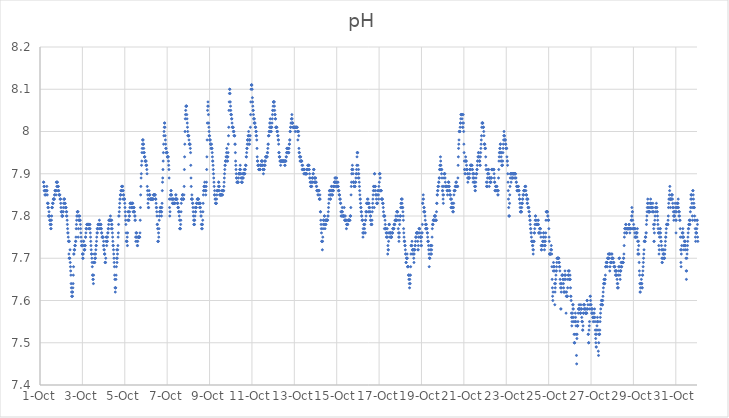
| Category | pH |
|---|---|
| 44835.166666666664 | 7.88 |
| 44835.177083333336 | 7.88 |
| 44835.1875 | 7.87 |
| 44835.197916666664 | 7.86 |
| 44835.208333333336 | 7.87 |
| 44835.21875 | 7.86 |
| 44835.229166666664 | 7.85 |
| 44835.239583333336 | 7.86 |
| 44835.25 | 7.86 |
| 44835.260416666664 | 7.86 |
| 44835.270833333336 | 7.85 |
| 44835.28125 | 7.85 |
| 44835.291666666664 | 7.86 |
| 44835.302083333336 | 7.86 |
| 44835.3125 | 7.86 |
| 44835.322916666664 | 7.87 |
| 44835.333333333336 | 7.86 |
| 44835.34375 | 7.85 |
| 44835.354166666664 | 7.83 |
| 44835.364583333336 | 7.83 |
| 44835.375 | 7.82 |
| 44835.385416666664 | 7.83 |
| 44835.395833333336 | 7.82 |
| 44835.40625 | 7.8 |
| 44835.416666666664 | 7.8 |
| 44835.427083333336 | 7.81 |
| 44835.4375 | 7.8 |
| 44835.447916666664 | 7.8 |
| 44835.458333333336 | 7.79 |
| 44835.46875 | 7.79 |
| 44835.479166666664 | 7.78 |
| 44835.489583333336 | 7.79 |
| 44835.5 | 7.78 |
| 44835.510416666664 | 7.77 |
| 44835.520833333336 | 7.77 |
| 44835.53125 | 7.78 |
| 44835.541666666664 | 7.79 |
| 44835.552083333336 | 7.8 |
| 44835.5625 | 7.82 |
| 44835.572916666664 | 7.82 |
| 44835.583333333336 | 7.82 |
| 44835.59375 | 7.83 |
| 44835.604166666664 | 7.83 |
| 44835.614583333336 | 7.83 |
| 44835.625 | 7.84 |
| 44835.635416666664 | 7.84 |
| 44835.645833333336 | 7.84 |
| 44835.65625 | 7.84 |
| 44835.666666666664 | 7.84 |
| 44835.677083333336 | 7.84 |
| 44835.6875 | 7.85 |
| 44835.697916666664 | 7.85 |
| 44835.708333333336 | 7.86 |
| 44835.71875 | 7.86 |
| 44835.729166666664 | 7.86 |
| 44835.739583333336 | 7.86 |
| 44835.75 | 7.86 |
| 44835.760416666664 | 7.85 |
| 44835.770833333336 | 7.88 |
| 44835.78125 | 7.88 |
| 44835.791666666664 | 7.87 |
| 44835.802083333336 | 7.86 |
| 44835.8125 | 7.88 |
| 44835.822916666664 | 7.88 |
| 44835.833333333336 | 7.87 |
| 44835.84375 | 7.87 |
| 44835.854166666664 | 7.87 |
| 44835.864583333336 | 7.87 |
| 44835.875 | 7.86 |
| 44835.885416666664 | 7.86 |
| 44835.895833333336 | 7.85 |
| 44835.90625 | 7.85 |
| 44835.916666666664 | 7.85 |
| 44835.927083333336 | 7.85 |
| 44835.9375 | 7.85 |
| 44835.947916666664 | 7.84 |
| 44835.958333333336 | 7.84 |
| 44835.96875 | 7.84 |
| 44835.979166666664 | 7.83 |
| 44835.989583333336 | 7.82 |
| 44836.0 | 7.81 |
| 44836.010416666664 | 7.81 |
| 44836.020833333336 | 7.81 |
| 44836.03125 | 7.8 |
| 44836.041666666664 | 7.8 |
| 44836.052083333336 | 7.8 |
| 44836.0625 | 7.8 |
| 44836.072916666664 | 7.8 |
| 44836.083333333336 | 7.81 |
| 44836.09375 | 7.81 |
| 44836.104166666664 | 7.82 |
| 44836.114583333336 | 7.83 |
| 44836.125 | 7.84 |
| 44836.135416666664 | 7.84 |
| 44836.145833333336 | 7.84 |
| 44836.15625 | 7.84 |
| 44836.166666666664 | 7.83 |
| 44836.177083333336 | 7.83 |
| 44836.1875 | 7.83 |
| 44836.197916666664 | 7.82 |
| 44836.208333333336 | 7.82 |
| 44836.21875 | 7.82 |
| 44836.229166666664 | 7.82 |
| 44836.239583333336 | 7.81 |
| 44836.25 | 7.8 |
| 44836.260416666664 | 7.81 |
| 44836.270833333336 | 7.8 |
| 44836.28125 | 7.79 |
| 44836.291666666664 | 7.78 |
| 44836.302083333336 | 7.77 |
| 44836.3125 | 7.76 |
| 44836.322916666664 | 7.76 |
| 44836.333333333336 | 7.75 |
| 44836.34375 | 7.74 |
| 44836.354166666664 | 7.74 |
| 44836.364583333336 | 7.71 |
| 44836.375 | 7.7 |
| 44836.385416666664 | 7.74 |
| 44836.395833333336 | 7.7 |
| 44836.40625 | 7.7 |
| 44836.416666666664 | 7.72 |
| 44836.427083333336 | 7.69 |
| 44836.4375 | 7.68 |
| 44836.447916666664 | 7.67 |
| 44836.458333333336 | 7.66 |
| 44836.46875 | 7.64 |
| 44836.479166666664 | 7.63 |
| 44836.489583333336 | 7.62 |
| 44836.5 | 7.61 |
| 44836.510416666664 | 7.61 |
| 44836.520833333336 | 7.62 |
| 44836.53125 | 7.61 |
| 44836.541666666664 | 7.62 |
| 44836.552083333336 | 7.63 |
| 44836.5625 | 7.64 |
| 44836.572916666664 | 7.66 |
| 44836.583333333336 | 7.68 |
| 44836.59375 | 7.71 |
| 44836.604166666664 | 7.71 |
| 44836.614583333336 | 7.72 |
| 44836.625 | 7.72 |
| 44836.635416666664 | 7.72 |
| 44836.645833333336 | 7.73 |
| 44836.65625 | 7.73 |
| 44836.666666666664 | 7.73 |
| 44836.677083333336 | 7.74 |
| 44836.6875 | 7.74 |
| 44836.697916666664 | 7.75 |
| 44836.708333333336 | 7.77 |
| 44836.71875 | 7.78 |
| 44836.729166666664 | 7.79 |
| 44836.739583333336 | 7.8 |
| 44836.75 | 7.8 |
| 44836.760416666664 | 7.81 |
| 44836.770833333336 | 7.81 |
| 44836.78125 | 7.81 |
| 44836.791666666664 | 7.81 |
| 44836.802083333336 | 7.75 |
| 44836.8125 | 7.77 |
| 44836.822916666664 | 7.79 |
| 44836.833333333336 | 7.8 |
| 44836.84375 | 7.8 |
| 44836.854166666664 | 7.79 |
| 44836.864583333336 | 7.79 |
| 44836.875 | 7.8 |
| 44836.885416666664 | 7.79 |
| 44836.895833333336 | 7.79 |
| 44836.90625 | 7.78 |
| 44836.916666666664 | 7.77 |
| 44836.927083333336 | 7.76 |
| 44836.9375 | 7.75 |
| 44836.947916666664 | 7.74 |
| 44836.958333333336 | 7.73 |
| 44836.96875 | 7.73 |
| 44836.979166666664 | 7.73 |
| 44836.989583333336 | 7.73 |
| 44837.0 | 7.71 |
| 44837.010416666664 | 7.71 |
| 44837.020833333336 | 7.7 |
| 44837.03125 | 7.7 |
| 44837.041666666664 | 7.71 |
| 44837.052083333336 | 7.74 |
| 44837.0625 | 7.74 |
| 44837.072916666664 | 7.73 |
| 44837.083333333336 | 7.72 |
| 44837.09375 | 7.72 |
| 44837.104166666664 | 7.72 |
| 44837.114583333336 | 7.72 |
| 44837.125 | 7.73 |
| 44837.135416666664 | 7.73 |
| 44837.145833333336 | 7.75 |
| 44837.15625 | 7.75 |
| 44837.166666666664 | 7.76 |
| 44837.177083333336 | 7.77 |
| 44837.1875 | 7.77 |
| 44837.197916666664 | 7.77 |
| 44837.208333333336 | 7.78 |
| 44837.21875 | 7.78 |
| 44837.229166666664 | 7.78 |
| 44837.239583333336 | 7.78 |
| 44837.25 | 7.78 |
| 44837.260416666664 | 7.78 |
| 44837.270833333336 | 7.78 |
| 44837.28125 | 7.78 |
| 44837.291666666664 | 7.78 |
| 44837.302083333336 | 7.78 |
| 44837.3125 | 7.77 |
| 44837.322916666664 | 7.77 |
| 44837.333333333336 | 7.77 |
| 44837.34375 | 7.78 |
| 44837.354166666664 | 7.78 |
| 44837.364583333336 | 7.77 |
| 44837.375 | 7.76 |
| 44837.385416666664 | 7.75 |
| 44837.395833333336 | 7.74 |
| 44837.40625 | 7.73 |
| 44837.416666666664 | 7.72 |
| 44837.427083333336 | 7.71 |
| 44837.4375 | 7.71 |
| 44837.447916666664 | 7.7 |
| 44837.458333333336 | 7.69 |
| 44837.46875 | 7.68 |
| 44837.479166666664 | 7.66 |
| 44837.489583333336 | 7.66 |
| 44837.5 | 7.65 |
| 44837.510416666664 | 7.65 |
| 44837.520833333336 | 7.64 |
| 44837.53125 | 7.66 |
| 44837.541666666664 | 7.69 |
| 44837.552083333336 | 7.69 |
| 44837.5625 | 7.71 |
| 44837.572916666664 | 7.69 |
| 44837.583333333336 | 7.69 |
| 44837.59375 | 7.7 |
| 44837.604166666664 | 7.7 |
| 44837.614583333336 | 7.7 |
| 44837.625 | 7.71 |
| 44837.635416666664 | 7.72 |
| 44837.645833333336 | 7.73 |
| 44837.65625 | 7.73 |
| 44837.666666666664 | 7.74 |
| 44837.677083333336 | 7.75 |
| 44837.6875 | 7.76 |
| 44837.697916666664 | 7.77 |
| 44837.708333333336 | 7.76 |
| 44837.71875 | 7.77 |
| 44837.729166666664 | 7.77 |
| 44837.739583333336 | 7.78 |
| 44837.75 | 7.78 |
| 44837.760416666664 | 7.78 |
| 44837.770833333336 | 7.78 |
| 44837.78125 | 7.78 |
| 44837.791666666664 | 7.78 |
| 44837.802083333336 | 7.79 |
| 44837.8125 | 7.78 |
| 44837.822916666664 | 7.77 |
| 44837.833333333336 | 7.77 |
| 44837.84375 | 7.78 |
| 44837.854166666664 | 7.78 |
| 44837.864583333336 | 7.78 |
| 44837.875 | 7.78 |
| 44837.885416666664 | 7.77 |
| 44837.895833333336 | 7.77 |
| 44837.90625 | 7.76 |
| 44837.916666666664 | 7.76 |
| 44837.927083333336 | 7.75 |
| 44837.9375 | 7.75 |
| 44837.947916666664 | 7.75 |
| 44837.958333333336 | 7.75 |
| 44837.96875 | 7.75 |
| 44837.979166666664 | 7.75 |
| 44837.989583333336 | 7.73 |
| 44838.0 | 7.74 |
| 44838.010416666664 | 7.73 |
| 44838.020833333336 | 7.72 |
| 44838.03125 | 7.72 |
| 44838.041666666664 | 7.71 |
| 44838.052083333336 | 7.71 |
| 44838.0625 | 7.71 |
| 44838.072916666664 | 7.69 |
| 44838.083333333336 | 7.69 |
| 44838.09375 | 7.69 |
| 44838.104166666664 | 7.7 |
| 44838.114583333336 | 7.74 |
| 44838.125 | 7.75 |
| 44838.135416666664 | 7.75 |
| 44838.145833333336 | 7.73 |
| 44838.15625 | 7.74 |
| 44838.166666666664 | 7.74 |
| 44838.177083333336 | 7.74 |
| 44838.1875 | 7.75 |
| 44838.197916666664 | 7.76 |
| 44838.208333333336 | 7.76 |
| 44838.21875 | 7.77 |
| 44838.229166666664 | 7.77 |
| 44838.239583333336 | 7.78 |
| 44838.25 | 7.79 |
| 44838.260416666664 | 7.79 |
| 44838.270833333336 | 7.79 |
| 44838.28125 | 7.79 |
| 44838.291666666664 | 7.79 |
| 44838.302083333336 | 7.79 |
| 44838.3125 | 7.79 |
| 44838.322916666664 | 7.8 |
| 44838.333333333336 | 7.79 |
| 44838.34375 | 7.79 |
| 44838.354166666664 | 7.79 |
| 44838.364583333336 | 7.77 |
| 44838.375 | 7.78 |
| 44838.385416666664 | 7.79 |
| 44838.395833333336 | 7.78 |
| 44838.40625 | 7.77 |
| 44838.416666666664 | 7.76 |
| 44838.427083333336 | 7.75 |
| 44838.4375 | 7.74 |
| 44838.447916666664 | 7.73 |
| 44838.458333333336 | 7.73 |
| 44838.46875 | 7.72 |
| 44838.479166666664 | 7.71 |
| 44838.489583333336 | 7.7 |
| 44838.5 | 7.69 |
| 44838.510416666664 | 7.68 |
| 44838.520833333336 | 7.66 |
| 44838.53125 | 7.65 |
| 44838.541666666664 | 7.63 |
| 44838.552083333336 | 7.62 |
| 44838.5625 | 7.63 |
| 44838.572916666664 | 7.63 |
| 44838.583333333336 | 7.65 |
| 44838.59375 | 7.66 |
| 44838.604166666664 | 7.68 |
| 44838.614583333336 | 7.7 |
| 44838.625 | 7.72 |
| 44838.635416666664 | 7.69 |
| 44838.645833333336 | 7.7 |
| 44838.65625 | 7.71 |
| 44838.666666666664 | 7.72 |
| 44838.677083333336 | 7.73 |
| 44838.6875 | 7.75 |
| 44838.697916666664 | 7.76 |
| 44838.708333333336 | 7.78 |
| 44838.71875 | 7.8 |
| 44838.729166666664 | 7.8 |
| 44838.739583333336 | 7.81 |
| 44838.75 | 7.82 |
| 44838.760416666664 | 7.83 |
| 44838.770833333336 | 7.84 |
| 44838.78125 | 7.84 |
| 44838.791666666664 | 7.85 |
| 44838.802083333336 | 7.85 |
| 44838.8125 | 7.85 |
| 44838.822916666664 | 7.86 |
| 44838.833333333336 | 7.86 |
| 44838.84375 | 7.86 |
| 44838.854166666664 | 7.87 |
| 44838.864583333336 | 7.87 |
| 44838.875 | 7.87 |
| 44838.885416666664 | 7.87 |
| 44838.895833333336 | 7.87 |
| 44838.90625 | 7.86 |
| 44838.916666666664 | 7.84 |
| 44838.927083333336 | 7.86 |
| 44838.9375 | 7.85 |
| 44838.947916666664 | 7.85 |
| 44838.958333333336 | 7.84 |
| 44838.96875 | 7.84 |
| 44838.979166666664 | 7.84 |
| 44838.989583333336 | 7.84 |
| 44839.0 | 7.83 |
| 44839.010416666664 | 7.82 |
| 44839.020833333336 | 7.81 |
| 44839.03125 | 7.8 |
| 44839.041666666664 | 7.79 |
| 44839.052083333336 | 7.78 |
| 44839.0625 | 7.76 |
| 44839.072916666664 | 7.74 |
| 44839.083333333336 | 7.74 |
| 44839.09375 | 7.74 |
| 44839.104166666664 | 7.74 |
| 44839.114583333336 | 7.75 |
| 44839.125 | 7.73 |
| 44839.135416666664 | 7.76 |
| 44839.145833333336 | 7.79 |
| 44839.15625 | 7.81 |
| 44839.166666666664 | 7.81 |
| 44839.177083333336 | 7.79 |
| 44839.1875 | 7.79 |
| 44839.197916666664 | 7.79 |
| 44839.208333333336 | 7.8 |
| 44839.21875 | 7.8 |
| 44839.229166666664 | 7.81 |
| 44839.239583333336 | 7.82 |
| 44839.25 | 7.83 |
| 44839.260416666664 | 7.83 |
| 44839.270833333336 | 7.83 |
| 44839.28125 | 7.83 |
| 44839.291666666664 | 7.83 |
| 44839.302083333336 | 7.83 |
| 44839.3125 | 7.83 |
| 44839.322916666664 | 7.82 |
| 44839.333333333336 | 7.82 |
| 44839.34375 | 7.83 |
| 44839.354166666664 | 7.83 |
| 44839.364583333336 | 7.83 |
| 44839.375 | 7.83 |
| 44839.385416666664 | 7.82 |
| 44839.395833333336 | 7.81 |
| 44839.40625 | 7.81 |
| 44839.416666666664 | 7.82 |
| 44839.427083333336 | 7.82 |
| 44839.4375 | 7.82 |
| 44839.447916666664 | 7.81 |
| 44839.458333333336 | 7.81 |
| 44839.46875 | 7.8 |
| 44839.479166666664 | 7.79 |
| 44839.489583333336 | 7.8 |
| 44839.5 | 7.79 |
| 44839.510416666664 | 7.75 |
| 44839.520833333336 | 7.74 |
| 44839.53125 | 7.76 |
| 44839.541666666664 | 7.76 |
| 44839.552083333336 | 7.75 |
| 44839.5625 | 7.76 |
| 44839.572916666664 | 7.75 |
| 44839.583333333336 | 7.74 |
| 44839.59375 | 7.73 |
| 44839.604166666664 | 7.73 |
| 44839.614583333336 | 7.74 |
| 44839.625 | 7.75 |
| 44839.635416666664 | 7.75 |
| 44839.645833333336 | 7.75 |
| 44839.65625 | 7.75 |
| 44839.666666666664 | 7.75 |
| 44839.677083333336 | 7.75 |
| 44839.6875 | 7.75 |
| 44839.697916666664 | 7.75 |
| 44839.708333333336 | 7.75 |
| 44839.71875 | 7.76 |
| 44839.729166666664 | 7.79 |
| 44839.739583333336 | 7.82 |
| 44839.75 | 7.85 |
| 44839.760416666664 | 7.87 |
| 44839.770833333336 | 7.89 |
| 44839.78125 | 7.9 |
| 44839.791666666664 | 7.92 |
| 44839.802083333336 | 7.93 |
| 44839.8125 | 7.95 |
| 44839.822916666664 | 7.96 |
| 44839.833333333336 | 7.97 |
| 44839.84375 | 7.98 |
| 44839.854166666664 | 7.98 |
| 44839.864583333336 | 7.98 |
| 44839.875 | 7.97 |
| 44839.885416666664 | 7.97 |
| 44839.895833333336 | 7.96 |
| 44839.90625 | 7.95 |
| 44839.916666666664 | 7.95 |
| 44839.927083333336 | 7.94 |
| 44839.9375 | 7.94 |
| 44839.947916666664 | 7.94 |
| 44839.958333333336 | 7.93 |
| 44839.96875 | 7.93 |
| 44839.979166666664 | 7.93 |
| 44839.989583333336 | 7.93 |
| 44840.0 | 7.92 |
| 44840.010416666664 | 7.93 |
| 44840.020833333336 | 7.92 |
| 44840.03125 | 7.92 |
| 44840.041666666664 | 7.91 |
| 44840.052083333336 | 7.9 |
| 44840.0625 | 7.87 |
| 44840.072916666664 | 7.86 |
| 44840.083333333336 | 7.85 |
| 44840.09375 | 7.83 |
| 44840.104166666664 | 7.84 |
| 44840.114583333336 | 7.82 |
| 44840.125 | 7.82 |
| 44840.135416666664 | 7.84 |
| 44840.145833333336 | 7.86 |
| 44840.15625 | 7.85 |
| 44840.166666666664 | 7.85 |
| 44840.177083333336 | 7.85 |
| 44840.1875 | 7.85 |
| 44840.197916666664 | 7.84 |
| 44840.208333333336 | 7.84 |
| 44840.21875 | 7.84 |
| 44840.229166666664 | 7.84 |
| 44840.239583333336 | 7.84 |
| 44840.25 | 7.84 |
| 44840.260416666664 | 7.84 |
| 44840.270833333336 | 7.84 |
| 44840.28125 | 7.84 |
| 44840.291666666664 | 7.84 |
| 44840.302083333336 | 7.84 |
| 44840.3125 | 7.84 |
| 44840.322916666664 | 7.84 |
| 44840.333333333336 | 7.84 |
| 44840.34375 | 7.84 |
| 44840.354166666664 | 7.85 |
| 44840.364583333336 | 7.85 |
| 44840.375 | 7.85 |
| 44840.385416666664 | 7.85 |
| 44840.395833333336 | 7.85 |
| 44840.40625 | 7.85 |
| 44840.416666666664 | 7.85 |
| 44840.427083333336 | 7.85 |
| 44840.4375 | 7.85 |
| 44840.447916666664 | 7.84 |
| 44840.458333333336 | 7.84 |
| 44840.46875 | 7.84 |
| 44840.479166666664 | 7.83 |
| 44840.489583333336 | 7.82 |
| 44840.5 | 7.82 |
| 44840.510416666664 | 7.81 |
| 44840.520833333336 | 7.8 |
| 44840.53125 | 7.78 |
| 44840.541666666664 | 7.78 |
| 44840.552083333336 | 7.77 |
| 44840.5625 | 7.74 |
| 44840.572916666664 | 7.74 |
| 44840.583333333336 | 7.74 |
| 44840.59375 | 7.76 |
| 44840.604166666664 | 7.75 |
| 44840.614583333336 | 7.77 |
| 44840.625 | 7.79 |
| 44840.635416666664 | 7.8 |
| 44840.645833333336 | 7.81 |
| 44840.65625 | 7.81 |
| 44840.666666666664 | 7.81 |
| 44840.677083333336 | 7.82 |
| 44840.6875 | 7.82 |
| 44840.697916666664 | 7.82 |
| 44840.708333333336 | 7.81 |
| 44840.71875 | 7.81 |
| 44840.729166666664 | 7.8 |
| 44840.739583333336 | 7.81 |
| 44840.75 | 7.82 |
| 44840.760416666664 | 7.83 |
| 44840.770833333336 | 7.86 |
| 44840.78125 | 7.88 |
| 44840.791666666664 | 7.89 |
| 44840.802083333336 | 7.91 |
| 44840.8125 | 7.93 |
| 44840.822916666664 | 7.95 |
| 44840.833333333336 | 7.97 |
| 44840.84375 | 7.99 |
| 44840.854166666664 | 8 |
| 44840.864583333336 | 8.01 |
| 44840.875 | 8.02 |
| 44840.885416666664 | 8.02 |
| 44840.895833333336 | 8.01 |
| 44840.90625 | 7.99 |
| 44840.916666666664 | 7.98 |
| 44840.927083333336 | 7.97 |
| 44840.9375 | 7.96 |
| 44840.947916666664 | 7.96 |
| 44840.958333333336 | 7.95 |
| 44840.96875 | 7.95 |
| 44840.979166666664 | 7.95 |
| 44840.989583333336 | 7.95 |
| 44841.0 | 7.95 |
| 44841.010416666664 | 7.94 |
| 44841.020833333336 | 7.94 |
| 44841.03125 | 7.94 |
| 44841.041666666664 | 7.94 |
| 44841.052083333336 | 7.94 |
| 44841.0625 | 7.93 |
| 44841.072916666664 | 7.92 |
| 44841.083333333336 | 7.91 |
| 44841.09375 | 7.89 |
| 44841.104166666664 | 7.84 |
| 44841.114583333336 | 7.82 |
| 44841.125 | 7.8 |
| 44841.135416666664 | 7.81 |
| 44841.145833333336 | 7.84 |
| 44841.15625 | 7.85 |
| 44841.166666666664 | 7.85 |
| 44841.177083333336 | 7.86 |
| 44841.1875 | 7.86 |
| 44841.197916666664 | 7.85 |
| 44841.208333333336 | 7.85 |
| 44841.21875 | 7.84 |
| 44841.229166666664 | 7.84 |
| 44841.239583333336 | 7.84 |
| 44841.25 | 7.83 |
| 44841.260416666664 | 7.83 |
| 44841.270833333336 | 7.84 |
| 44841.28125 | 7.84 |
| 44841.291666666664 | 7.84 |
| 44841.302083333336 | 7.83 |
| 44841.3125 | 7.83 |
| 44841.322916666664 | 7.83 |
| 44841.333333333336 | 7.83 |
| 44841.34375 | 7.83 |
| 44841.354166666664 | 7.83 |
| 44841.364583333336 | 7.83 |
| 44841.375 | 7.84 |
| 44841.385416666664 | 7.84 |
| 44841.395833333336 | 7.84 |
| 44841.40625 | 7.85 |
| 44841.416666666664 | 7.85 |
| 44841.427083333336 | 7.84 |
| 44841.4375 | 7.84 |
| 44841.447916666664 | 7.84 |
| 44841.458333333336 | 7.84 |
| 44841.46875 | 7.84 |
| 44841.479166666664 | 7.83 |
| 44841.489583333336 | 7.83 |
| 44841.5 | 7.83 |
| 44841.510416666664 | 7.82 |
| 44841.520833333336 | 7.82 |
| 44841.53125 | 7.82 |
| 44841.541666666664 | 7.81 |
| 44841.552083333336 | 7.81 |
| 44841.5625 | 7.81 |
| 44841.572916666664 | 7.8 |
| 44841.583333333336 | 7.79 |
| 44841.59375 | 7.77 |
| 44841.604166666664 | 7.77 |
| 44841.614583333336 | 7.77 |
| 44841.625 | 7.77 |
| 44841.635416666664 | 7.78 |
| 44841.645833333336 | 7.79 |
| 44841.65625 | 7.81 |
| 44841.666666666664 | 7.83 |
| 44841.677083333336 | 7.84 |
| 44841.6875 | 7.84 |
| 44841.697916666664 | 7.84 |
| 44841.708333333336 | 7.84 |
| 44841.71875 | 7.85 |
| 44841.729166666664 | 7.85 |
| 44841.739583333336 | 7.85 |
| 44841.75 | 7.84 |
| 44841.760416666664 | 7.84 |
| 44841.770833333336 | 7.84 |
| 44841.78125 | 7.84 |
| 44841.791666666664 | 7.85 |
| 44841.802083333336 | 7.87 |
| 44841.8125 | 7.91 |
| 44841.822916666664 | 7.94 |
| 44841.833333333336 | 7.97 |
| 44841.84375 | 8 |
| 44841.854166666664 | 8.03 |
| 44841.864583333336 | 8.04 |
| 44841.875 | 8.05 |
| 44841.885416666664 | 8.06 |
| 44841.895833333336 | 8.06 |
| 44841.90625 | 8.06 |
| 44841.916666666664 | 8.06 |
| 44841.927083333336 | 8.04 |
| 44841.9375 | 8.03 |
| 44841.947916666664 | 8.02 |
| 44841.958333333336 | 8.01 |
| 44841.96875 | 8 |
| 44841.979166666664 | 7.99 |
| 44841.989583333336 | 7.99 |
| 44842.0 | 7.99 |
| 44842.010416666664 | 7.99 |
| 44842.020833333336 | 7.99 |
| 44842.03125 | 7.98 |
| 44842.041666666664 | 7.97 |
| 44842.052083333336 | 7.97 |
| 44842.0625 | 7.97 |
| 44842.072916666664 | 7.97 |
| 44842.083333333336 | 7.97 |
| 44842.09375 | 7.96 |
| 44842.104166666664 | 7.95 |
| 44842.114583333336 | 7.92 |
| 44842.125 | 7.89 |
| 44842.135416666664 | 7.87 |
| 44842.145833333336 | 7.84 |
| 44842.15625 | 7.84 |
| 44842.166666666664 | 7.85 |
| 44842.177083333336 | 7.84 |
| 44842.1875 | 7.84 |
| 44842.197916666664 | 7.83 |
| 44842.208333333336 | 7.83 |
| 44842.21875 | 7.82 |
| 44842.229166666664 | 7.81 |
| 44842.239583333336 | 7.8 |
| 44842.25 | 7.79 |
| 44842.260416666664 | 7.78 |
| 44842.270833333336 | 7.78 |
| 44842.28125 | 7.79 |
| 44842.291666666664 | 7.78 |
| 44842.302083333336 | 7.79 |
| 44842.3125 | 7.8 |
| 44842.322916666664 | 7.82 |
| 44842.333333333336 | 7.81 |
| 44842.34375 | 7.81 |
| 44842.354166666664 | 7.82 |
| 44842.364583333336 | 7.82 |
| 44842.375 | 7.82 |
| 44842.385416666664 | 7.83 |
| 44842.395833333336 | 7.83 |
| 44842.40625 | 7.83 |
| 44842.416666666664 | 7.84 |
| 44842.427083333336 | 7.84 |
| 44842.4375 | 7.84 |
| 44842.447916666664 | 7.84 |
| 44842.458333333336 | 7.84 |
| 44842.46875 | 7.84 |
| 44842.479166666664 | 7.84 |
| 44842.489583333336 | 7.83 |
| 44842.5 | 7.83 |
| 44842.510416666664 | 7.83 |
| 44842.520833333336 | 7.83 |
| 44842.53125 | 7.82 |
| 44842.541666666664 | 7.83 |
| 44842.552083333336 | 7.83 |
| 44842.5625 | 7.83 |
| 44842.572916666664 | 7.82 |
| 44842.583333333336 | 7.81 |
| 44842.59375 | 7.8 |
| 44842.604166666664 | 7.8 |
| 44842.614583333336 | 7.78 |
| 44842.625 | 7.77 |
| 44842.635416666664 | 7.78 |
| 44842.645833333336 | 7.78 |
| 44842.65625 | 7.77 |
| 44842.666666666664 | 7.78 |
| 44842.677083333336 | 7.79 |
| 44842.6875 | 7.81 |
| 44842.697916666664 | 7.83 |
| 44842.708333333336 | 7.85 |
| 44842.71875 | 7.86 |
| 44842.729166666664 | 7.86 |
| 44842.739583333336 | 7.87 |
| 44842.75 | 7.87 |
| 44842.760416666664 | 7.87 |
| 44842.770833333336 | 7.88 |
| 44842.78125 | 7.87 |
| 44842.791666666664 | 7.86 |
| 44842.802083333336 | 7.86 |
| 44842.8125 | 7.86 |
| 44842.822916666664 | 7.85 |
| 44842.833333333336 | 7.86 |
| 44842.84375 | 7.87 |
| 44842.854166666664 | 7.88 |
| 44842.864583333336 | 7.91 |
| 44842.875 | 7.94 |
| 44842.885416666664 | 7.98 |
| 44842.895833333336 | 8.02 |
| 44842.90625 | 8.05 |
| 44842.916666666664 | 8.06 |
| 44842.927083333336 | 8.07 |
| 44842.9375 | 8.06 |
| 44842.947916666664 | 8.04 |
| 44842.958333333336 | 8.02 |
| 44842.96875 | 8.01 |
| 44842.979166666664 | 8 |
| 44842.989583333336 | 7.99 |
| 44843.0 | 7.99 |
| 44843.010416666664 | 7.98 |
| 44843.020833333336 | 7.98 |
| 44843.03125 | 7.98 |
| 44843.041666666664 | 7.97 |
| 44843.052083333336 | 7.97 |
| 44843.0625 | 7.97 |
| 44843.072916666664 | 7.96 |
| 44843.083333333336 | 7.96 |
| 44843.09375 | 7.97 |
| 44843.104166666664 | 7.96 |
| 44843.114583333336 | 7.96 |
| 44843.125 | 7.95 |
| 44843.135416666664 | 7.94 |
| 44843.145833333336 | 7.93 |
| 44843.15625 | 7.93 |
| 44843.166666666664 | 7.92 |
| 44843.177083333336 | 7.91 |
| 44843.1875 | 7.9 |
| 44843.197916666664 | 7.89 |
| 44843.208333333336 | 7.88 |
| 44843.21875 | 7.87 |
| 44843.229166666664 | 7.85 |
| 44843.239583333336 | 7.86 |
| 44843.25 | 7.85 |
| 44843.260416666664 | 7.84 |
| 44843.270833333336 | 7.84 |
| 44843.28125 | 7.83 |
| 44843.291666666664 | 7.83 |
| 44843.302083333336 | 7.83 |
| 44843.3125 | 7.83 |
| 44843.322916666664 | 7.83 |
| 44843.333333333336 | 7.84 |
| 44843.34375 | 7.85 |
| 44843.354166666664 | 7.86 |
| 44843.364583333336 | 7.86 |
| 44843.375 | 7.86 |
| 44843.385416666664 | 7.86 |
| 44843.395833333336 | 7.86 |
| 44843.40625 | 7.86 |
| 44843.416666666664 | 7.87 |
| 44843.427083333336 | 7.88 |
| 44843.4375 | 7.88 |
| 44843.447916666664 | 7.87 |
| 44843.458333333336 | 7.87 |
| 44843.46875 | 7.86 |
| 44843.479166666664 | 7.85 |
| 44843.489583333336 | 7.85 |
| 44843.5 | 7.85 |
| 44843.510416666664 | 7.85 |
| 44843.520833333336 | 7.85 |
| 44843.53125 | 7.85 |
| 44843.541666666664 | 7.85 |
| 44843.552083333336 | 7.85 |
| 44843.5625 | 7.85 |
| 44843.572916666664 | 7.85 |
| 44843.583333333336 | 7.86 |
| 44843.59375 | 7.85 |
| 44843.604166666664 | 7.86 |
| 44843.614583333336 | 7.85 |
| 44843.625 | 7.86 |
| 44843.635416666664 | 7.86 |
| 44843.645833333336 | 7.86 |
| 44843.65625 | 7.86 |
| 44843.666666666664 | 7.86 |
| 44843.677083333336 | 7.87 |
| 44843.6875 | 7.88 |
| 44843.697916666664 | 7.89 |
| 44843.708333333336 | 7.9 |
| 44843.71875 | 7.91 |
| 44843.729166666664 | 7.92 |
| 44843.739583333336 | 7.92 |
| 44843.75 | 7.93 |
| 44843.760416666664 | 7.93 |
| 44843.770833333336 | 7.93 |
| 44843.78125 | 7.94 |
| 44843.791666666664 | 7.94 |
| 44843.802083333336 | 7.95 |
| 44843.8125 | 7.96 |
| 44843.822916666664 | 7.93 |
| 44843.833333333336 | 7.94 |
| 44843.84375 | 7.94 |
| 44843.854166666664 | 7.93 |
| 44843.864583333336 | 7.94 |
| 44843.875 | 7.95 |
| 44843.885416666664 | 7.97 |
| 44843.895833333336 | 7.99 |
| 44843.90625 | 8.01 |
| 44843.916666666664 | 8.05 |
| 44843.927083333336 | 8.07 |
| 44843.9375 | 8.09 |
| 44843.947916666664 | 8.1 |
| 44843.958333333336 | 8.1 |
| 44843.96875 | 8.09 |
| 44843.979166666664 | 8.07 |
| 44843.989583333336 | 8.06 |
| 44844.0 | 8.05 |
| 44844.010416666664 | 8.04 |
| 44844.020833333336 | 8.04 |
| 44844.03125 | 8.04 |
| 44844.041666666664 | 8.03 |
| 44844.052083333336 | 8.03 |
| 44844.0625 | 8.02 |
| 44844.072916666664 | 8.01 |
| 44844.083333333336 | 8.01 |
| 44844.09375 | 8.01 |
| 44844.104166666664 | 8.01 |
| 44844.114583333336 | 8.01 |
| 44844.125 | 8 |
| 44844.135416666664 | 8 |
| 44844.145833333336 | 8 |
| 44844.15625 | 7.99 |
| 44844.166666666664 | 7.99 |
| 44844.177083333336 | 7.99 |
| 44844.1875 | 7.99 |
| 44844.197916666664 | 7.97 |
| 44844.208333333336 | 7.97 |
| 44844.21875 | 7.95 |
| 44844.229166666664 | 7.93 |
| 44844.239583333336 | 7.92 |
| 44844.25 | 7.91 |
| 44844.260416666664 | 7.9 |
| 44844.270833333336 | 7.89 |
| 44844.28125 | 7.89 |
| 44844.291666666664 | 7.88 |
| 44844.302083333336 | 7.88 |
| 44844.3125 | 7.88 |
| 44844.322916666664 | 7.88 |
| 44844.333333333336 | 7.88 |
| 44844.34375 | 7.88 |
| 44844.354166666664 | 7.88 |
| 44844.364583333336 | 7.89 |
| 44844.375 | 7.9 |
| 44844.385416666664 | 7.9 |
| 44844.395833333336 | 7.9 |
| 44844.40625 | 7.9 |
| 44844.416666666664 | 7.9 |
| 44844.427083333336 | 7.91 |
| 44844.4375 | 7.91 |
| 44844.447916666664 | 7.92 |
| 44844.458333333336 | 7.91 |
| 44844.46875 | 7.9 |
| 44844.479166666664 | 7.9 |
| 44844.489583333336 | 7.89 |
| 44844.5 | 7.89 |
| 44844.510416666664 | 7.88 |
| 44844.520833333336 | 7.88 |
| 44844.53125 | 7.88 |
| 44844.541666666664 | 7.88 |
| 44844.552083333336 | 7.89 |
| 44844.5625 | 7.89 |
| 44844.572916666664 | 7.9 |
| 44844.583333333336 | 7.9 |
| 44844.59375 | 7.89 |
| 44844.604166666664 | 7.9 |
| 44844.614583333336 | 7.9 |
| 44844.625 | 7.9 |
| 44844.635416666664 | 7.91 |
| 44844.645833333336 | 7.9 |
| 44844.65625 | 7.9 |
| 44844.666666666664 | 7.9 |
| 44844.677083333336 | 7.91 |
| 44844.6875 | 7.91 |
| 44844.697916666664 | 7.92 |
| 44844.708333333336 | 7.92 |
| 44844.71875 | 7.92 |
| 44844.729166666664 | 7.94 |
| 44844.739583333336 | 7.94 |
| 44844.75 | 7.95 |
| 44844.760416666664 | 7.96 |
| 44844.770833333336 | 7.96 |
| 44844.78125 | 7.97 |
| 44844.791666666664 | 7.98 |
| 44844.802083333336 | 7.98 |
| 44844.8125 | 7.98 |
| 44844.822916666664 | 7.99 |
| 44844.833333333336 | 7.99 |
| 44844.84375 | 8 |
| 44844.854166666664 | 7.97 |
| 44844.864583333336 | 7.99 |
| 44844.875 | 7.98 |
| 44844.885416666664 | 7.97 |
| 44844.895833333336 | 7.98 |
| 44844.90625 | 7.98 |
| 44844.916666666664 | 7.99 |
| 44844.927083333336 | 8.01 |
| 44844.9375 | 8.04 |
| 44844.947916666664 | 8.07 |
| 44844.958333333336 | 8.1 |
| 44844.96875 | 8.11 |
| 44844.979166666664 | 8.11 |
| 44844.989583333336 | 8.11 |
| 44845.0 | 8.11 |
| 44845.010416666664 | 8.1 |
| 44845.020833333336 | 8.08 |
| 44845.03125 | 8.07 |
| 44845.041666666664 | 8.06 |
| 44845.052083333336 | 8.05 |
| 44845.0625 | 8.05 |
| 44845.072916666664 | 8.04 |
| 44845.083333333336 | 8.03 |
| 44845.09375 | 8.03 |
| 44845.104166666664 | 8.02 |
| 44845.114583333336 | 8.03 |
| 44845.125 | 8.02 |
| 44845.135416666664 | 8.02 |
| 44845.145833333336 | 8.02 |
| 44845.15625 | 8.01 |
| 44845.166666666664 | 8.01 |
| 44845.177083333336 | 8.01 |
| 44845.1875 | 8 |
| 44845.197916666664 | 7.99 |
| 44845.208333333336 | 8 |
| 44845.21875 | 7.99 |
| 44845.229166666664 | 7.98 |
| 44845.239583333336 | 7.96 |
| 44845.25 | 7.94 |
| 44845.260416666664 | 7.93 |
| 44845.270833333336 | 7.93 |
| 44845.28125 | 7.92 |
| 44845.291666666664 | 7.92 |
| 44845.302083333336 | 7.92 |
| 44845.3125 | 7.92 |
| 44845.322916666664 | 7.91 |
| 44845.333333333336 | 7.91 |
| 44845.34375 | 7.91 |
| 44845.354166666664 | 7.91 |
| 44845.364583333336 | 7.91 |
| 44845.375 | 7.91 |
| 44845.385416666664 | 7.91 |
| 44845.395833333336 | 7.92 |
| 44845.40625 | 7.92 |
| 44845.416666666664 | 7.92 |
| 44845.427083333336 | 7.92 |
| 44845.4375 | 7.92 |
| 44845.447916666664 | 7.93 |
| 44845.458333333336 | 7.93 |
| 44845.46875 | 7.93 |
| 44845.479166666664 | 7.93 |
| 44845.489583333336 | 7.93 |
| 44845.5 | 7.92 |
| 44845.510416666664 | 7.92 |
| 44845.520833333336 | 7.91 |
| 44845.53125 | 7.91 |
| 44845.541666666664 | 7.9 |
| 44845.552083333336 | 7.91 |
| 44845.5625 | 7.91 |
| 44845.572916666664 | 7.91 |
| 44845.583333333336 | 7.92 |
| 44845.59375 | 7.92 |
| 44845.604166666664 | 7.93 |
| 44845.614583333336 | 7.93 |
| 44845.625 | 7.92 |
| 44845.635416666664 | 7.93 |
| 44845.645833333336 | 7.94 |
| 44845.65625 | 7.94 |
| 44845.666666666664 | 7.94 |
| 44845.677083333336 | 7.94 |
| 44845.6875 | 7.94 |
| 44845.697916666664 | 7.94 |
| 44845.708333333336 | 7.94 |
| 44845.71875 | 7.94 |
| 44845.729166666664 | 7.95 |
| 44845.739583333336 | 7.95 |
| 44845.75 | 7.96 |
| 44845.760416666664 | 7.97 |
| 44845.770833333336 | 7.97 |
| 44845.78125 | 7.99 |
| 44845.791666666664 | 7.99 |
| 44845.802083333336 | 7.99 |
| 44845.8125 | 8 |
| 44845.822916666664 | 8 |
| 44845.833333333336 | 8.01 |
| 44845.84375 | 8.02 |
| 44845.854166666664 | 8.02 |
| 44845.864583333336 | 8.03 |
| 44845.875 | 8.01 |
| 44845.885416666664 | 8 |
| 44845.895833333336 | 8.01 |
| 44845.90625 | 8.01 |
| 44845.916666666664 | 8 |
| 44845.927083333336 | 8.01 |
| 44845.9375 | 8.01 |
| 44845.947916666664 | 8.02 |
| 44845.958333333336 | 8.03 |
| 44845.96875 | 8.04 |
| 44845.979166666664 | 8.05 |
| 44845.989583333336 | 8.05 |
| 44846.0 | 8.06 |
| 44846.010416666664 | 8.07 |
| 44846.020833333336 | 8.07 |
| 44846.03125 | 8.07 |
| 44846.041666666664 | 8.07 |
| 44846.052083333336 | 8.07 |
| 44846.0625 | 8.06 |
| 44846.072916666664 | 8.05 |
| 44846.083333333336 | 8.04 |
| 44846.09375 | 8.04 |
| 44846.104166666664 | 8.03 |
| 44846.114583333336 | 8.03 |
| 44846.125 | 8.01 |
| 44846.135416666664 | 8.01 |
| 44846.145833333336 | 8.01 |
| 44846.15625 | 8.01 |
| 44846.166666666664 | 8.01 |
| 44846.177083333336 | 8.01 |
| 44846.1875 | 8 |
| 44846.197916666664 | 8 |
| 44846.208333333336 | 8 |
| 44846.21875 | 7.99 |
| 44846.229166666664 | 7.99 |
| 44846.239583333336 | 7.98 |
| 44846.25 | 7.98 |
| 44846.260416666664 | 7.97 |
| 44846.270833333336 | 7.95 |
| 44846.28125 | 7.95 |
| 44846.291666666664 | 7.94 |
| 44846.302083333336 | 7.94 |
| 44846.3125 | 7.94 |
| 44846.322916666664 | 7.93 |
| 44846.333333333336 | 7.93 |
| 44846.34375 | 7.93 |
| 44846.354166666664 | 7.92 |
| 44846.364583333336 | 7.93 |
| 44846.375 | 7.93 |
| 44846.385416666664 | 7.93 |
| 44846.395833333336 | 7.93 |
| 44846.40625 | 7.93 |
| 44846.416666666664 | 7.93 |
| 44846.427083333336 | 7.93 |
| 44846.4375 | 7.93 |
| 44846.447916666664 | 7.93 |
| 44846.458333333336 | 7.93 |
| 44846.46875 | 7.93 |
| 44846.479166666664 | 7.93 |
| 44846.489583333336 | 7.93 |
| 44846.5 | 7.93 |
| 44846.510416666664 | 7.93 |
| 44846.520833333336 | 7.93 |
| 44846.53125 | 7.93 |
| 44846.541666666664 | 7.93 |
| 44846.552083333336 | 7.92 |
| 44846.5625 | 7.92 |
| 44846.572916666664 | 7.93 |
| 44846.583333333336 | 7.93 |
| 44846.59375 | 7.93 |
| 44846.604166666664 | 7.93 |
| 44846.614583333336 | 7.94 |
| 44846.625 | 7.94 |
| 44846.635416666664 | 7.95 |
| 44846.645833333336 | 7.96 |
| 44846.65625 | 7.95 |
| 44846.666666666664 | 7.96 |
| 44846.677083333336 | 7.95 |
| 44846.6875 | 7.96 |
| 44846.697916666664 | 7.96 |
| 44846.708333333336 | 7.96 |
| 44846.71875 | 7.95 |
| 44846.729166666664 | 7.95 |
| 44846.739583333336 | 7.95 |
| 44846.75 | 7.96 |
| 44846.760416666664 | 7.97 |
| 44846.770833333336 | 7.97 |
| 44846.78125 | 7.98 |
| 44846.791666666664 | 7.98 |
| 44846.802083333336 | 8 |
| 44846.8125 | 8 |
| 44846.822916666664 | 8.01 |
| 44846.833333333336 | 8.01 |
| 44846.84375 | 8.02 |
| 44846.854166666664 | 8.02 |
| 44846.864583333336 | 8.03 |
| 44846.875 | 8.03 |
| 44846.885416666664 | 8.04 |
| 44846.895833333336 | 8.03 |
| 44846.90625 | 8.02 |
| 44846.916666666664 | 8.02 |
| 44846.927083333336 | 8.02 |
| 44846.9375 | 8.01 |
| 44846.947916666664 | 8.01 |
| 44846.958333333336 | 8.01 |
| 44846.96875 | 8.01 |
| 44846.979166666664 | 8.01 |
| 44846.989583333336 | 8.01 |
| 44847.0 | 8.01 |
| 44847.010416666664 | 8.01 |
| 44847.020833333336 | 8.01 |
| 44847.03125 | 8.01 |
| 44847.041666666664 | 8 |
| 44847.052083333336 | 8.01 |
| 44847.0625 | 8.01 |
| 44847.072916666664 | 8.01 |
| 44847.083333333336 | 8.01 |
| 44847.09375 | 8.01 |
| 44847.104166666664 | 8.01 |
| 44847.114583333336 | 8.01 |
| 44847.125 | 8.01 |
| 44847.135416666664 | 8.01 |
| 44847.145833333336 | 8 |
| 44847.15625 | 8 |
| 44847.166666666664 | 7.98 |
| 44847.177083333336 | 8 |
| 44847.1875 | 8 |
| 44847.197916666664 | 8 |
| 44847.208333333336 | 7.99 |
| 44847.21875 | 7.96 |
| 44847.229166666664 | 7.95 |
| 44847.239583333336 | 7.95 |
| 44847.25 | 7.94 |
| 44847.260416666664 | 7.94 |
| 44847.270833333336 | 7.93 |
| 44847.28125 | 7.94 |
| 44847.291666666664 | 7.93 |
| 44847.302083333336 | 7.94 |
| 44847.3125 | 7.93 |
| 44847.322916666664 | 7.93 |
| 44847.333333333336 | 7.93 |
| 44847.34375 | 7.93 |
| 44847.354166666664 | 7.93 |
| 44847.364583333336 | 7.92 |
| 44847.375 | 7.91 |
| 44847.385416666664 | 7.91 |
| 44847.395833333336 | 7.92 |
| 44847.40625 | 7.91 |
| 44847.416666666664 | 7.91 |
| 44847.427083333336 | 7.91 |
| 44847.4375 | 7.91 |
| 44847.447916666664 | 7.9 |
| 44847.458333333336 | 7.91 |
| 44847.46875 | 7.91 |
| 44847.479166666664 | 7.91 |
| 44847.489583333336 | 7.9 |
| 44847.5 | 7.9 |
| 44847.510416666664 | 7.9 |
| 44847.520833333336 | 7.9 |
| 44847.53125 | 7.9 |
| 44847.541666666664 | 7.9 |
| 44847.552083333336 | 7.9 |
| 44847.5625 | 7.9 |
| 44847.572916666664 | 7.9 |
| 44847.583333333336 | 7.9 |
| 44847.59375 | 7.91 |
| 44847.604166666664 | 7.91 |
| 44847.614583333336 | 7.91 |
| 44847.625 | 7.91 |
| 44847.635416666664 | 7.92 |
| 44847.645833333336 | 7.92 |
| 44847.65625 | 7.92 |
| 44847.666666666664 | 7.92 |
| 44847.677083333336 | 7.92 |
| 44847.6875 | 7.91 |
| 44847.697916666664 | 7.92 |
| 44847.708333333336 | 7.91 |
| 44847.71875 | 7.9 |
| 44847.729166666664 | 7.89 |
| 44847.739583333336 | 7.89 |
| 44847.75 | 7.88 |
| 44847.760416666664 | 7.88 |
| 44847.770833333336 | 7.87 |
| 44847.78125 | 7.87 |
| 44847.791666666664 | 7.87 |
| 44847.802083333336 | 7.87 |
| 44847.8125 | 7.88 |
| 44847.822916666664 | 7.87 |
| 44847.833333333336 | 7.88 |
| 44847.84375 | 7.89 |
| 44847.854166666664 | 7.89 |
| 44847.864583333336 | 7.88 |
| 44847.875 | 7.89 |
| 44847.885416666664 | 7.9 |
| 44847.895833333336 | 7.9 |
| 44847.90625 | 7.91 |
| 44847.916666666664 | 7.91 |
| 44847.927083333336 | 7.91 |
| 44847.9375 | 7.88 |
| 44847.947916666664 | 7.88 |
| 44847.958333333336 | 7.89 |
| 44847.96875 | 7.89 |
| 44847.979166666664 | 7.89 |
| 44847.989583333336 | 7.88 |
| 44848.0 | 7.88 |
| 44848.010416666664 | 7.89 |
| 44848.020833333336 | 7.88 |
| 44848.03125 | 7.88 |
| 44848.041666666664 | 7.87 |
| 44848.052083333336 | 7.87 |
| 44848.0625 | 7.86 |
| 44848.072916666664 | 7.86 |
| 44848.083333333336 | 7.86 |
| 44848.09375 | 7.86 |
| 44848.104166666664 | 7.86 |
| 44848.114583333336 | 7.85 |
| 44848.125 | 7.85 |
| 44848.135416666664 | 7.86 |
| 44848.145833333336 | 7.86 |
| 44848.15625 | 7.86 |
| 44848.166666666664 | 7.86 |
| 44848.177083333336 | 7.84 |
| 44848.1875 | 7.84 |
| 44848.197916666664 | 7.84 |
| 44848.208333333336 | 7.85 |
| 44848.21875 | 7.84 |
| 44848.229166666664 | 7.81 |
| 44848.239583333336 | 7.81 |
| 44848.25 | 7.79 |
| 44848.260416666664 | 7.78 |
| 44848.270833333336 | 7.77 |
| 44848.28125 | 7.76 |
| 44848.291666666664 | 7.74 |
| 44848.302083333336 | 7.74 |
| 44848.3125 | 7.74 |
| 44848.322916666664 | 7.72 |
| 44848.333333333336 | 7.74 |
| 44848.34375 | 7.75 |
| 44848.354166666664 | 7.77 |
| 44848.364583333336 | 7.78 |
| 44848.375 | 7.79 |
| 44848.385416666664 | 7.79 |
| 44848.395833333336 | 7.79 |
| 44848.40625 | 7.78 |
| 44848.416666666664 | 7.8 |
| 44848.427083333336 | 7.8 |
| 44848.4375 | 7.78 |
| 44848.447916666664 | 7.77 |
| 44848.458333333336 | 7.79 |
| 44848.46875 | 7.79 |
| 44848.479166666664 | 7.78 |
| 44848.489583333336 | 7.78 |
| 44848.5 | 7.79 |
| 44848.510416666664 | 7.79 |
| 44848.520833333336 | 7.79 |
| 44848.53125 | 7.79 |
| 44848.541666666664 | 7.79 |
| 44848.552083333336 | 7.79 |
| 44848.5625 | 7.79 |
| 44848.572916666664 | 7.79 |
| 44848.583333333336 | 7.8 |
| 44848.59375 | 7.8 |
| 44848.604166666664 | 7.81 |
| 44848.614583333336 | 7.82 |
| 44848.625 | 7.83 |
| 44848.635416666664 | 7.84 |
| 44848.645833333336 | 7.85 |
| 44848.65625 | 7.86 |
| 44848.666666666664 | 7.86 |
| 44848.677083333336 | 7.86 |
| 44848.6875 | 7.86 |
| 44848.697916666664 | 7.84 |
| 44848.708333333336 | 7.84 |
| 44848.71875 | 7.85 |
| 44848.729166666664 | 7.85 |
| 44848.739583333336 | 7.85 |
| 44848.75 | 7.87 |
| 44848.760416666664 | 7.86 |
| 44848.770833333336 | 7.87 |
| 44848.78125 | 7.86 |
| 44848.791666666664 | 7.85 |
| 44848.802083333336 | 7.85 |
| 44848.8125 | 7.86 |
| 44848.822916666664 | 7.86 |
| 44848.833333333336 | 7.86 |
| 44848.84375 | 7.86 |
| 44848.854166666664 | 7.87 |
| 44848.864583333336 | 7.87 |
| 44848.875 | 7.87 |
| 44848.885416666664 | 7.88 |
| 44848.895833333336 | 7.88 |
| 44848.90625 | 7.88 |
| 44848.916666666664 | 7.89 |
| 44848.927083333336 | 7.89 |
| 44848.9375 | 7.88 |
| 44848.947916666664 | 7.88 |
| 44848.958333333336 | 7.89 |
| 44848.96875 | 7.87 |
| 44848.979166666664 | 7.87 |
| 44848.989583333336 | 7.88 |
| 44849.0 | 7.89 |
| 44849.010416666664 | 7.88 |
| 44849.020833333336 | 7.88 |
| 44849.03125 | 7.87 |
| 44849.041666666664 | 7.87 |
| 44849.052083333336 | 7.87 |
| 44849.0625 | 7.88 |
| 44849.072916666664 | 7.87 |
| 44849.083333333336 | 7.86 |
| 44849.09375 | 7.86 |
| 44849.104166666664 | 7.86 |
| 44849.114583333336 | 7.85 |
| 44849.125 | 7.85 |
| 44849.135416666664 | 7.85 |
| 44849.145833333336 | 7.84 |
| 44849.15625 | 7.84 |
| 44849.166666666664 | 7.84 |
| 44849.177083333336 | 7.83 |
| 44849.1875 | 7.83 |
| 44849.197916666664 | 7.81 |
| 44849.208333333336 | 7.8 |
| 44849.21875 | 7.8 |
| 44849.229166666664 | 7.81 |
| 44849.239583333336 | 7.81 |
| 44849.25 | 7.81 |
| 44849.260416666664 | 7.82 |
| 44849.270833333336 | 7.81 |
| 44849.28125 | 7.8 |
| 44849.291666666664 | 7.8 |
| 44849.302083333336 | 7.8 |
| 44849.3125 | 7.8 |
| 44849.322916666664 | 7.8 |
| 44849.333333333336 | 7.8 |
| 44849.34375 | 7.8 |
| 44849.354166666664 | 7.82 |
| 44849.364583333336 | 7.8 |
| 44849.375 | 7.79 |
| 44849.385416666664 | 7.79 |
| 44849.395833333336 | 7.79 |
| 44849.40625 | 7.8 |
| 44849.416666666664 | 7.79 |
| 44849.427083333336 | 7.79 |
| 44849.4375 | 7.79 |
| 44849.447916666664 | 7.79 |
| 44849.458333333336 | 7.77 |
| 44849.46875 | 7.78 |
| 44849.479166666664 | 7.78 |
| 44849.489583333336 | 7.78 |
| 44849.5 | 7.78 |
| 44849.510416666664 | 7.78 |
| 44849.520833333336 | 7.78 |
| 44849.53125 | 7.79 |
| 44849.541666666664 | 7.79 |
| 44849.552083333336 | 7.79 |
| 44849.5625 | 7.79 |
| 44849.572916666664 | 7.79 |
| 44849.583333333336 | 7.79 |
| 44849.59375 | 7.79 |
| 44849.604166666664 | 7.79 |
| 44849.614583333336 | 7.79 |
| 44849.625 | 7.79 |
| 44849.635416666664 | 7.8 |
| 44849.645833333336 | 7.8 |
| 44849.65625 | 7.8 |
| 44849.666666666664 | 7.82 |
| 44849.677083333336 | 7.85 |
| 44849.6875 | 7.87 |
| 44849.697916666664 | 7.88 |
| 44849.708333333336 | 7.9 |
| 44849.71875 | 7.91 |
| 44849.729166666664 | 7.91 |
| 44849.739583333336 | 7.92 |
| 44849.75 | 7.91 |
| 44849.760416666664 | 7.91 |
| 44849.770833333336 | 7.9 |
| 44849.78125 | 7.88 |
| 44849.791666666664 | 7.88 |
| 44849.802083333336 | 7.88 |
| 44849.8125 | 7.88 |
| 44849.822916666664 | 7.87 |
| 44849.833333333336 | 7.87 |
| 44849.84375 | 7.87 |
| 44849.854166666664 | 7.87 |
| 44849.864583333336 | 7.87 |
| 44849.875 | 7.88 |
| 44849.885416666664 | 7.88 |
| 44849.895833333336 | 7.88 |
| 44849.90625 | 7.89 |
| 44849.916666666664 | 7.9 |
| 44849.927083333336 | 7.9 |
| 44849.9375 | 7.91 |
| 44849.947916666664 | 7.92 |
| 44849.958333333336 | 7.94 |
| 44849.96875 | 7.95 |
| 44849.979166666664 | 7.95 |
| 44849.989583333336 | 7.95 |
| 44850.0 | 7.92 |
| 44850.010416666664 | 7.9 |
| 44850.020833333336 | 7.89 |
| 44850.03125 | 7.91 |
| 44850.041666666664 | 7.9 |
| 44850.052083333336 | 7.89 |
| 44850.0625 | 7.88 |
| 44850.072916666664 | 7.87 |
| 44850.083333333336 | 7.86 |
| 44850.09375 | 7.85 |
| 44850.104166666664 | 7.84 |
| 44850.114583333336 | 7.84 |
| 44850.125 | 7.83 |
| 44850.135416666664 | 7.82 |
| 44850.145833333336 | 7.82 |
| 44850.15625 | 7.81 |
| 44850.166666666664 | 7.81 |
| 44850.177083333336 | 7.8 |
| 44850.1875 | 7.8 |
| 44850.197916666664 | 7.79 |
| 44850.208333333336 | 7.79 |
| 44850.21875 | 7.79 |
| 44850.229166666664 | 7.76 |
| 44850.239583333336 | 7.75 |
| 44850.25 | 7.77 |
| 44850.260416666664 | 7.76 |
| 44850.270833333336 | 7.76 |
| 44850.28125 | 7.78 |
| 44850.291666666664 | 7.78 |
| 44850.302083333336 | 7.78 |
| 44850.3125 | 7.77 |
| 44850.322916666664 | 7.78 |
| 44850.333333333336 | 7.76 |
| 44850.34375 | 7.76 |
| 44850.354166666664 | 7.79 |
| 44850.364583333336 | 7.79 |
| 44850.375 | 7.81 |
| 44850.385416666664 | 7.8 |
| 44850.395833333336 | 7.81 |
| 44850.40625 | 7.83 |
| 44850.416666666664 | 7.81 |
| 44850.427083333336 | 7.83 |
| 44850.4375 | 7.83 |
| 44850.447916666664 | 7.84 |
| 44850.458333333336 | 7.83 |
| 44850.46875 | 7.83 |
| 44850.479166666664 | 7.84 |
| 44850.489583333336 | 7.83 |
| 44850.5 | 7.81 |
| 44850.510416666664 | 7.83 |
| 44850.520833333336 | 7.83 |
| 44850.53125 | 7.82 |
| 44850.541666666664 | 7.82 |
| 44850.552083333336 | 7.82 |
| 44850.5625 | 7.81 |
| 44850.572916666664 | 7.81 |
| 44850.583333333336 | 7.8 |
| 44850.59375 | 7.79 |
| 44850.604166666664 | 7.8 |
| 44850.614583333336 | 7.79 |
| 44850.625 | 7.78 |
| 44850.635416666664 | 7.78 |
| 44850.645833333336 | 7.78 |
| 44850.65625 | 7.78 |
| 44850.666666666664 | 7.79 |
| 44850.677083333336 | 7.81 |
| 44850.6875 | 7.82 |
| 44850.697916666664 | 7.83 |
| 44850.708333333336 | 7.84 |
| 44850.71875 | 7.85 |
| 44850.729166666664 | 7.86 |
| 44850.739583333336 | 7.87 |
| 44850.75 | 7.87 |
| 44850.760416666664 | 7.86 |
| 44850.770833333336 | 7.82 |
| 44850.78125 | 7.9 |
| 44850.791666666664 | 7.9 |
| 44850.802083333336 | 7.87 |
| 44850.8125 | 7.87 |
| 44850.822916666664 | 7.87 |
| 44850.833333333336 | 7.86 |
| 44850.84375 | 7.85 |
| 44850.854166666664 | 7.85 |
| 44850.864583333336 | 7.85 |
| 44850.875 | 7.84 |
| 44850.885416666664 | 7.83 |
| 44850.895833333336 | 7.83 |
| 44850.90625 | 7.83 |
| 44850.916666666664 | 7.83 |
| 44850.927083333336 | 7.83 |
| 44850.9375 | 7.85 |
| 44850.947916666664 | 7.86 |
| 44850.958333333336 | 7.86 |
| 44850.96875 | 7.85 |
| 44850.979166666664 | 7.84 |
| 44850.989583333336 | 7.87 |
| 44851.0 | 7.86 |
| 44851.010416666664 | 7.88 |
| 44851.020833333336 | 7.9 |
| 44851.03125 | 7.9 |
| 44851.041666666664 | 7.9 |
| 44851.052083333336 | 7.89 |
| 44851.0625 | 7.86 |
| 44851.072916666664 | 7.86 |
| 44851.083333333336 | 7.86 |
| 44851.09375 | 7.86 |
| 44851.104166666664 | 7.86 |
| 44851.114583333336 | 7.84 |
| 44851.125 | 7.84 |
| 44851.135416666664 | 7.84 |
| 44851.145833333336 | 7.84 |
| 44851.15625 | 7.84 |
| 44851.166666666664 | 7.83 |
| 44851.177083333336 | 7.83 |
| 44851.1875 | 7.83 |
| 44851.197916666664 | 7.82 |
| 44851.208333333336 | 7.81 |
| 44851.21875 | 7.8 |
| 44851.229166666664 | 7.8 |
| 44851.239583333336 | 7.8 |
| 44851.25 | 7.77 |
| 44851.260416666664 | 7.8 |
| 44851.270833333336 | 7.8 |
| 44851.28125 | 7.79 |
| 44851.291666666664 | 7.78 |
| 44851.302083333336 | 7.77 |
| 44851.3125 | 7.77 |
| 44851.322916666664 | 7.77 |
| 44851.333333333336 | 7.76 |
| 44851.34375 | 7.75 |
| 44851.354166666664 | 7.76 |
| 44851.364583333336 | 7.75 |
| 44851.375 | 7.76 |
| 44851.385416666664 | 7.77 |
| 44851.395833333336 | 7.75 |
| 44851.40625 | 7.71 |
| 44851.416666666664 | 7.73 |
| 44851.427083333336 | 7.72 |
| 44851.4375 | 7.72 |
| 44851.447916666664 | 7.74 |
| 44851.458333333336 | 7.76 |
| 44851.46875 | 7.78 |
| 44851.479166666664 | 7.78 |
| 44851.489583333336 | 7.78 |
| 44851.5 | 7.76 |
| 44851.510416666664 | 7.75 |
| 44851.520833333336 | 7.76 |
| 44851.53125 | 7.76 |
| 44851.541666666664 | 7.76 |
| 44851.552083333336 | 7.75 |
| 44851.5625 | 7.75 |
| 44851.572916666664 | 7.75 |
| 44851.583333333336 | 7.75 |
| 44851.59375 | 7.75 |
| 44851.604166666664 | 7.76 |
| 44851.614583333336 | 7.76 |
| 44851.625 | 7.76 |
| 44851.635416666664 | 7.76 |
| 44851.645833333336 | 7.77 |
| 44851.65625 | 7.77 |
| 44851.666666666664 | 7.77 |
| 44851.677083333336 | 7.77 |
| 44851.6875 | 7.77 |
| 44851.697916666664 | 7.77 |
| 44851.708333333336 | 7.78 |
| 44851.71875 | 7.78 |
| 44851.729166666664 | 7.78 |
| 44851.739583333336 | 7.78 |
| 44851.75 | 7.79 |
| 44851.760416666664 | 7.79 |
| 44851.770833333336 | 7.79 |
| 44851.78125 | 7.79 |
| 44851.791666666664 | 7.8 |
| 44851.802083333336 | 7.79 |
| 44851.8125 | 7.79 |
| 44851.822916666664 | 7.79 |
| 44851.833333333336 | 7.81 |
| 44851.84375 | 7.81 |
| 44851.854166666664 | 7.81 |
| 44851.864583333336 | 7.81 |
| 44851.875 | 7.81 |
| 44851.885416666664 | 7.8 |
| 44851.895833333336 | 7.79 |
| 44851.90625 | 7.77 |
| 44851.916666666664 | 7.76 |
| 44851.927083333336 | 7.75 |
| 44851.9375 | 7.74 |
| 44851.947916666664 | 7.75 |
| 44851.958333333336 | 7.76 |
| 44851.96875 | 7.78 |
| 44851.979166666664 | 7.79 |
| 44851.989583333336 | 7.8 |
| 44852.0 | 7.8 |
| 44852.010416666664 | 7.8 |
| 44852.020833333336 | 7.82 |
| 44852.03125 | 7.83 |
| 44852.041666666664 | 7.83 |
| 44852.052083333336 | 7.84 |
| 44852.0625 | 7.84 |
| 44852.072916666664 | 7.82 |
| 44852.083333333336 | 7.83 |
| 44852.09375 | 7.84 |
| 44852.104166666664 | 7.82 |
| 44852.114583333336 | 7.82 |
| 44852.125 | 7.81 |
| 44852.135416666664 | 7.8 |
| 44852.145833333336 | 7.79 |
| 44852.15625 | 7.77 |
| 44852.166666666664 | 7.76 |
| 44852.177083333336 | 7.75 |
| 44852.1875 | 7.74 |
| 44852.197916666664 | 7.74 |
| 44852.208333333336 | 7.74 |
| 44852.21875 | 7.73 |
| 44852.229166666664 | 7.73 |
| 44852.239583333336 | 7.72 |
| 44852.25 | 7.71 |
| 44852.260416666664 | 7.71 |
| 44852.270833333336 | 7.69 |
| 44852.28125 | 7.69 |
| 44852.291666666664 | 7.7 |
| 44852.302083333336 | 7.7 |
| 44852.3125 | 7.7 |
| 44852.322916666664 | 7.71 |
| 44852.333333333336 | 7.7 |
| 44852.34375 | 7.68 |
| 44852.354166666664 | 7.68 |
| 44852.364583333336 | 7.68 |
| 44852.375 | 7.68 |
| 44852.385416666664 | 7.66 |
| 44852.395833333336 | 7.66 |
| 44852.40625 | 7.65 |
| 44852.416666666664 | 7.66 |
| 44852.427083333336 | 7.64 |
| 44852.4375 | 7.63 |
| 44852.447916666664 | 7.65 |
| 44852.458333333336 | 7.66 |
| 44852.46875 | 7.64 |
| 44852.479166666664 | 7.66 |
| 44852.489583333336 | 7.68 |
| 44852.5 | 7.71 |
| 44852.510416666664 | 7.73 |
| 44852.520833333336 | 7.73 |
| 44852.53125 | 7.73 |
| 44852.541666666664 | 7.73 |
| 44852.552083333336 | 7.74 |
| 44852.5625 | 7.71 |
| 44852.572916666664 | 7.72 |
| 44852.583333333336 | 7.72 |
| 44852.59375 | 7.72 |
| 44852.604166666664 | 7.72 |
| 44852.614583333336 | 7.72 |
| 44852.625 | 7.71 |
| 44852.635416666664 | 7.7 |
| 44852.645833333336 | 7.69 |
| 44852.65625 | 7.71 |
| 44852.666666666664 | 7.72 |
| 44852.677083333336 | 7.72 |
| 44852.6875 | 7.72 |
| 44852.697916666664 | 7.73 |
| 44852.708333333336 | 7.73 |
| 44852.71875 | 7.74 |
| 44852.729166666664 | 7.75 |
| 44852.739583333336 | 7.75 |
| 44852.75 | 7.75 |
| 44852.760416666664 | 7.76 |
| 44852.770833333336 | 7.76 |
| 44852.78125 | 7.76 |
| 44852.791666666664 | 7.76 |
| 44852.802083333336 | 7.76 |
| 44852.8125 | 7.76 |
| 44852.822916666664 | 7.74 |
| 44852.833333333336 | 7.72 |
| 44852.84375 | 7.72 |
| 44852.854166666664 | 7.73 |
| 44852.864583333336 | 7.75 |
| 44852.875 | 7.76 |
| 44852.885416666664 | 7.77 |
| 44852.895833333336 | 7.77 |
| 44852.90625 | 7.77 |
| 44852.916666666664 | 7.77 |
| 44852.927083333336 | 7.76 |
| 44852.9375 | 7.75 |
| 44852.947916666664 | 7.75 |
| 44852.958333333336 | 7.75 |
| 44852.96875 | 7.75 |
| 44852.979166666664 | 7.74 |
| 44852.989583333336 | 7.73 |
| 44853.0 | 7.73 |
| 44853.010416666664 | 7.75 |
| 44853.020833333336 | 7.76 |
| 44853.03125 | 7.76 |
| 44853.041666666664 | 7.78 |
| 44853.052083333336 | 7.83 |
| 44853.0625 | 7.83 |
| 44853.072916666664 | 7.84 |
| 44853.083333333336 | 7.85 |
| 44853.09375 | 7.84 |
| 44853.104166666664 | 7.81 |
| 44853.114583333336 | 7.82 |
| 44853.125 | 7.82 |
| 44853.135416666664 | 7.81 |
| 44853.145833333336 | 7.81 |
| 44853.15625 | 7.81 |
| 44853.166666666664 | 7.8 |
| 44853.177083333336 | 7.79 |
| 44853.1875 | 7.78 |
| 44853.197916666664 | 7.77 |
| 44853.208333333336 | 7.77 |
| 44853.21875 | 7.78 |
| 44853.229166666664 | 7.78 |
| 44853.239583333336 | 7.77 |
| 44853.25 | 7.77 |
| 44853.260416666664 | 7.77 |
| 44853.270833333336 | 7.76 |
| 44853.28125 | 7.76 |
| 44853.291666666664 | 7.75 |
| 44853.302083333336 | 7.74 |
| 44853.3125 | 7.74 |
| 44853.322916666664 | 7.74 |
| 44853.333333333336 | 7.73 |
| 44853.34375 | 7.72 |
| 44853.354166666664 | 7.71 |
| 44853.364583333336 | 7.68 |
| 44853.375 | 7.7 |
| 44853.385416666664 | 7.7 |
| 44853.395833333336 | 7.7 |
| 44853.40625 | 7.71 |
| 44853.416666666664 | 7.72 |
| 44853.427083333336 | 7.73 |
| 44853.4375 | 7.73 |
| 44853.447916666664 | 7.71 |
| 44853.458333333336 | 7.73 |
| 44853.46875 | 7.71 |
| 44853.479166666664 | 7.72 |
| 44853.489583333336 | 7.73 |
| 44853.5 | 7.75 |
| 44853.510416666664 | 7.77 |
| 44853.520833333336 | 7.78 |
| 44853.53125 | 7.78 |
| 44853.541666666664 | 7.78 |
| 44853.552083333336 | 7.79 |
| 44853.5625 | 7.79 |
| 44853.572916666664 | 7.79 |
| 44853.583333333336 | 7.79 |
| 44853.59375 | 7.79 |
| 44853.604166666664 | 7.79 |
| 44853.614583333336 | 7.8 |
| 44853.625 | 7.8 |
| 44853.635416666664 | 7.8 |
| 44853.645833333336 | 7.8 |
| 44853.65625 | 7.8 |
| 44853.666666666664 | 7.79 |
| 44853.677083333336 | 7.79 |
| 44853.6875 | 7.79 |
| 44853.697916666664 | 7.79 |
| 44853.708333333336 | 7.81 |
| 44853.71875 | 7.83 |
| 44853.729166666664 | 7.83 |
| 44853.739583333336 | 7.85 |
| 44853.75 | 7.85 |
| 44853.760416666664 | 7.86 |
| 44853.770833333336 | 7.86 |
| 44853.78125 | 7.87 |
| 44853.791666666664 | 7.87 |
| 44853.802083333336 | 7.87 |
| 44853.8125 | 7.88 |
| 44853.822916666664 | 7.88 |
| 44853.833333333336 | 7.89 |
| 44853.84375 | 7.89 |
| 44853.854166666664 | 7.91 |
| 44853.864583333336 | 7.91 |
| 44853.875 | 7.92 |
| 44853.885416666664 | 7.92 |
| 44853.895833333336 | 7.94 |
| 44853.90625 | 7.93 |
| 44853.916666666664 | 7.92 |
| 44853.927083333336 | 7.91 |
| 44853.9375 | 7.91 |
| 44853.947916666664 | 7.9 |
| 44853.958333333336 | 7.91 |
| 44853.96875 | 7.89 |
| 44853.979166666664 | 7.87 |
| 44853.989583333336 | 7.86 |
| 44854.0 | 7.86 |
| 44854.010416666664 | 7.85 |
| 44854.020833333336 | 7.84 |
| 44854.03125 | 7.83 |
| 44854.041666666664 | 7.85 |
| 44854.052083333336 | 7.87 |
| 44854.0625 | 7.89 |
| 44854.072916666664 | 7.9 |
| 44854.083333333336 | 7.9 |
| 44854.09375 | 7.9 |
| 44854.104166666664 | 7.9 |
| 44854.114583333336 | 7.89 |
| 44854.125 | 7.88 |
| 44854.135416666664 | 7.87 |
| 44854.145833333336 | 7.87 |
| 44854.15625 | 7.87 |
| 44854.166666666664 | 7.87 |
| 44854.177083333336 | 7.87 |
| 44854.1875 | 7.87 |
| 44854.197916666664 | 7.87 |
| 44854.208333333336 | 7.86 |
| 44854.21875 | 7.86 |
| 44854.229166666664 | 7.85 |
| 44854.239583333336 | 7.86 |
| 44854.25 | 7.86 |
| 44854.260416666664 | 7.87 |
| 44854.270833333336 | 7.88 |
| 44854.28125 | 7.88 |
| 44854.291666666664 | 7.88 |
| 44854.302083333336 | 7.87 |
| 44854.3125 | 7.87 |
| 44854.322916666664 | 7.86 |
| 44854.333333333336 | 7.86 |
| 44854.34375 | 7.85 |
| 44854.354166666664 | 7.85 |
| 44854.364583333336 | 7.85 |
| 44854.375 | 7.84 |
| 44854.385416666664 | 7.84 |
| 44854.395833333336 | 7.82 |
| 44854.40625 | 7.82 |
| 44854.416666666664 | 7.84 |
| 44854.427083333336 | 7.83 |
| 44854.4375 | 7.82 |
| 44854.447916666664 | 7.82 |
| 44854.458333333336 | 7.83 |
| 44854.46875 | 7.82 |
| 44854.479166666664 | 7.81 |
| 44854.489583333336 | 7.81 |
| 44854.5 | 7.81 |
| 44854.510416666664 | 7.82 |
| 44854.520833333336 | 7.83 |
| 44854.53125 | 7.85 |
| 44854.541666666664 | 7.86 |
| 44854.552083333336 | 7.86 |
| 44854.5625 | 7.86 |
| 44854.572916666664 | 7.86 |
| 44854.583333333336 | 7.86 |
| 44854.59375 | 7.87 |
| 44854.604166666664 | 7.87 |
| 44854.614583333336 | 7.87 |
| 44854.625 | 7.88 |
| 44854.635416666664 | 7.88 |
| 44854.645833333336 | 7.88 |
| 44854.65625 | 7.87 |
| 44854.666666666664 | 7.87 |
| 44854.677083333336 | 7.87 |
| 44854.6875 | 7.87 |
| 44854.697916666664 | 7.87 |
| 44854.708333333336 | 7.87 |
| 44854.71875 | 7.89 |
| 44854.729166666664 | 7.92 |
| 44854.739583333336 | 7.94 |
| 44854.75 | 7.96 |
| 44854.760416666664 | 7.97 |
| 44854.770833333336 | 7.98 |
| 44854.78125 | 8 |
| 44854.791666666664 | 8 |
| 44854.802083333336 | 8 |
| 44854.8125 | 8 |
| 44854.822916666664 | 8.01 |
| 44854.833333333336 | 8.02 |
| 44854.84375 | 8.02 |
| 44854.854166666664 | 8.03 |
| 44854.864583333336 | 8.04 |
| 44854.875 | 8.04 |
| 44854.885416666664 | 8.04 |
| 44854.895833333336 | 8.04 |
| 44854.90625 | 8.04 |
| 44854.916666666664 | 8.03 |
| 44854.927083333336 | 8.04 |
| 44854.9375 | 8.01 |
| 44854.947916666664 | 8.02 |
| 44854.958333333336 | 8.01 |
| 44854.96875 | 8.04 |
| 44854.979166666664 | 8.02 |
| 44854.989583333336 | 8 |
| 44855.0 | 7.97 |
| 44855.010416666664 | 7.95 |
| 44855.020833333336 | 7.93 |
| 44855.03125 | 7.91 |
| 44855.041666666664 | 7.91 |
| 44855.052083333336 | 7.9 |
| 44855.0625 | 7.9 |
| 44855.072916666664 | 7.93 |
| 44855.083333333336 | 7.94 |
| 44855.09375 | 7.93 |
| 44855.104166666664 | 7.93 |
| 44855.114583333336 | 7.93 |
| 44855.125 | 7.92 |
| 44855.135416666664 | 7.91 |
| 44855.145833333336 | 7.91 |
| 44855.15625 | 7.91 |
| 44855.166666666664 | 7.9 |
| 44855.177083333336 | 7.89 |
| 44855.1875 | 7.88 |
| 44855.197916666664 | 7.9 |
| 44855.208333333336 | 7.89 |
| 44855.21875 | 7.89 |
| 44855.229166666664 | 7.89 |
| 44855.239583333336 | 7.89 |
| 44855.25 | 7.89 |
| 44855.260416666664 | 7.89 |
| 44855.270833333336 | 7.9 |
| 44855.28125 | 7.91 |
| 44855.291666666664 | 7.91 |
| 44855.302083333336 | 7.91 |
| 44855.3125 | 7.92 |
| 44855.322916666664 | 7.92 |
| 44855.333333333336 | 7.92 |
| 44855.34375 | 7.92 |
| 44855.354166666664 | 7.92 |
| 44855.364583333336 | 7.92 |
| 44855.375 | 7.92 |
| 44855.385416666664 | 7.92 |
| 44855.395833333336 | 7.91 |
| 44855.40625 | 7.91 |
| 44855.416666666664 | 7.9 |
| 44855.427083333336 | 7.89 |
| 44855.4375 | 7.88 |
| 44855.447916666664 | 7.89 |
| 44855.458333333336 | 7.9 |
| 44855.46875 | 7.9 |
| 44855.479166666664 | 7.89 |
| 44855.489583333336 | 7.88 |
| 44855.5 | 7.88 |
| 44855.510416666664 | 7.87 |
| 44855.520833333336 | 7.87 |
| 44855.53125 | 7.86 |
| 44855.541666666664 | 7.86 |
| 44855.552083333336 | 7.87 |
| 44855.5625 | 7.88 |
| 44855.572916666664 | 7.89 |
| 44855.583333333336 | 7.9 |
| 44855.59375 | 7.9 |
| 44855.604166666664 | 7.9 |
| 44855.614583333336 | 7.91 |
| 44855.625 | 7.91 |
| 44855.635416666664 | 7.92 |
| 44855.645833333336 | 7.93 |
| 44855.65625 | 7.93 |
| 44855.666666666664 | 7.94 |
| 44855.677083333336 | 7.94 |
| 44855.6875 | 7.95 |
| 44855.697916666664 | 7.95 |
| 44855.708333333336 | 7.94 |
| 44855.71875 | 7.94 |
| 44855.729166666664 | 7.93 |
| 44855.739583333336 | 7.93 |
| 44855.75 | 7.93 |
| 44855.760416666664 | 7.92 |
| 44855.770833333336 | 7.92 |
| 44855.78125 | 7.94 |
| 44855.791666666664 | 7.95 |
| 44855.802083333336 | 7.96 |
| 44855.8125 | 7.97 |
| 44855.822916666664 | 7.98 |
| 44855.833333333336 | 7.99 |
| 44855.84375 | 8.01 |
| 44855.854166666664 | 8.02 |
| 44855.864583333336 | 8.02 |
| 44855.875 | 8.02 |
| 44855.885416666664 | 8.02 |
| 44855.895833333336 | 8.02 |
| 44855.90625 | 8.01 |
| 44855.916666666664 | 8.01 |
| 44855.927083333336 | 8.01 |
| 44855.9375 | 8 |
| 44855.947916666664 | 7.99 |
| 44855.958333333336 | 7.97 |
| 44855.96875 | 7.97 |
| 44855.979166666664 | 7.97 |
| 44855.989583333336 | 7.97 |
| 44856.0 | 7.96 |
| 44856.010416666664 | 7.96 |
| 44856.020833333336 | 7.96 |
| 44856.03125 | 7.94 |
| 44856.041666666664 | 7.92 |
| 44856.052083333336 | 7.91 |
| 44856.0625 | 7.88 |
| 44856.072916666664 | 7.87 |
| 44856.083333333336 | 7.87 |
| 44856.09375 | 7.87 |
| 44856.104166666664 | 7.88 |
| 44856.114583333336 | 7.89 |
| 44856.125 | 7.9 |
| 44856.135416666664 | 7.9 |
| 44856.145833333336 | 7.91 |
| 44856.15625 | 7.91 |
| 44856.166666666664 | 7.91 |
| 44856.177083333336 | 7.9 |
| 44856.1875 | 7.89 |
| 44856.197916666664 | 7.87 |
| 44856.208333333336 | 7.89 |
| 44856.21875 | 7.89 |
| 44856.229166666664 | 7.89 |
| 44856.239583333336 | 7.88 |
| 44856.25 | 7.88 |
| 44856.260416666664 | 7.88 |
| 44856.270833333336 | 7.89 |
| 44856.28125 | 7.88 |
| 44856.291666666664 | 7.89 |
| 44856.302083333336 | 7.89 |
| 44856.3125 | 7.91 |
| 44856.322916666664 | 7.91 |
| 44856.333333333336 | 7.91 |
| 44856.34375 | 7.91 |
| 44856.354166666664 | 7.91 |
| 44856.364583333336 | 7.91 |
| 44856.375 | 7.91 |
| 44856.385416666664 | 7.91 |
| 44856.395833333336 | 7.91 |
| 44856.40625 | 7.91 |
| 44856.416666666664 | 7.91 |
| 44856.427083333336 | 7.9 |
| 44856.4375 | 7.89 |
| 44856.447916666664 | 7.88 |
| 44856.458333333336 | 7.88 |
| 44856.46875 | 7.86 |
| 44856.479166666664 | 7.86 |
| 44856.489583333336 | 7.86 |
| 44856.5 | 7.87 |
| 44856.510416666664 | 7.87 |
| 44856.520833333336 | 7.87 |
| 44856.53125 | 7.87 |
| 44856.541666666664 | 7.87 |
| 44856.552083333336 | 7.86 |
| 44856.5625 | 7.87 |
| 44856.572916666664 | 7.86 |
| 44856.583333333336 | 7.86 |
| 44856.59375 | 7.86 |
| 44856.604166666664 | 7.85 |
| 44856.614583333336 | 7.85 |
| 44856.625 | 7.86 |
| 44856.635416666664 | 7.89 |
| 44856.645833333336 | 7.91 |
| 44856.65625 | 7.93 |
| 44856.666666666664 | 7.94 |
| 44856.677083333336 | 7.95 |
| 44856.6875 | 7.95 |
| 44856.697916666664 | 7.96 |
| 44856.708333333336 | 7.96 |
| 44856.71875 | 7.97 |
| 44856.729166666664 | 7.97 |
| 44856.739583333336 | 7.95 |
| 44856.75 | 7.93 |
| 44856.760416666664 | 7.94 |
| 44856.770833333336 | 7.95 |
| 44856.78125 | 7.93 |
| 44856.791666666664 | 7.92 |
| 44856.802083333336 | 7.92 |
| 44856.8125 | 7.92 |
| 44856.822916666664 | 7.92 |
| 44856.833333333336 | 7.93 |
| 44856.84375 | 7.95 |
| 44856.854166666664 | 7.96 |
| 44856.864583333336 | 7.97 |
| 44856.875 | 7.98 |
| 44856.885416666664 | 7.99 |
| 44856.895833333336 | 8 |
| 44856.90625 | 7.99 |
| 44856.916666666664 | 7.99 |
| 44856.927083333336 | 7.98 |
| 44856.9375 | 7.98 |
| 44856.947916666664 | 7.98 |
| 44856.958333333336 | 7.98 |
| 44856.96875 | 7.97 |
| 44856.979166666664 | 7.97 |
| 44856.989583333336 | 7.96 |
| 44857.0 | 7.96 |
| 44857.010416666664 | 7.96 |
| 44857.020833333336 | 7.96 |
| 44857.03125 | 7.94 |
| 44857.041666666664 | 7.93 |
| 44857.052083333336 | 7.93 |
| 44857.0625 | 7.92 |
| 44857.072916666664 | 7.9 |
| 44857.083333333336 | 7.88 |
| 44857.09375 | 7.86 |
| 44857.104166666664 | 7.84 |
| 44857.114583333336 | 7.82 |
| 44857.125 | 7.8 |
| 44857.135416666664 | 7.8 |
| 44857.145833333336 | 7.8 |
| 44857.15625 | 7.83 |
| 44857.166666666664 | 7.85 |
| 44857.177083333336 | 7.87 |
| 44857.1875 | 7.89 |
| 44857.197916666664 | 7.9 |
| 44857.208333333336 | 7.9 |
| 44857.21875 | 7.9 |
| 44857.229166666664 | 7.88 |
| 44857.239583333336 | 7.9 |
| 44857.25 | 7.9 |
| 44857.260416666664 | 7.89 |
| 44857.270833333336 | 7.89 |
| 44857.28125 | 7.9 |
| 44857.291666666664 | 7.9 |
| 44857.302083333336 | 7.89 |
| 44857.3125 | 7.89 |
| 44857.322916666664 | 7.9 |
| 44857.333333333336 | 7.9 |
| 44857.34375 | 7.9 |
| 44857.354166666664 | 7.9 |
| 44857.364583333336 | 7.9 |
| 44857.375 | 7.89 |
| 44857.385416666664 | 7.9 |
| 44857.395833333336 | 7.9 |
| 44857.40625 | 7.9 |
| 44857.416666666664 | 7.9 |
| 44857.427083333336 | 7.9 |
| 44857.4375 | 7.9 |
| 44857.447916666664 | 7.89 |
| 44857.458333333336 | 7.89 |
| 44857.46875 | 7.88 |
| 44857.479166666664 | 7.88 |
| 44857.489583333336 | 7.87 |
| 44857.5 | 7.87 |
| 44857.510416666664 | 7.86 |
| 44857.520833333336 | 7.86 |
| 44857.53125 | 7.86 |
| 44857.541666666664 | 7.87 |
| 44857.552083333336 | 7.87 |
| 44857.5625 | 7.87 |
| 44857.572916666664 | 7.87 |
| 44857.583333333336 | 7.86 |
| 44857.59375 | 7.86 |
| 44857.604166666664 | 7.86 |
| 44857.614583333336 | 7.85 |
| 44857.625 | 7.84 |
| 44857.635416666664 | 7.84 |
| 44857.645833333336 | 7.83 |
| 44857.65625 | 7.82 |
| 44857.666666666664 | 7.81 |
| 44857.677083333336 | 7.81 |
| 44857.6875 | 7.81 |
| 44857.697916666664 | 7.81 |
| 44857.708333333336 | 7.81 |
| 44857.71875 | 7.81 |
| 44857.729166666664 | 7.82 |
| 44857.739583333336 | 7.83 |
| 44857.75 | 7.83 |
| 44857.760416666664 | 7.83 |
| 44857.770833333336 | 7.84 |
| 44857.78125 | 7.84 |
| 44857.791666666664 | 7.85 |
| 44857.802083333336 | 7.85 |
| 44857.8125 | 7.85 |
| 44857.822916666664 | 7.86 |
| 44857.833333333336 | 7.86 |
| 44857.84375 | 7.86 |
| 44857.854166666664 | 7.86 |
| 44857.864583333336 | 7.86 |
| 44857.875 | 7.86 |
| 44857.885416666664 | 7.87 |
| 44857.895833333336 | 7.87 |
| 44857.90625 | 7.87 |
| 44857.916666666664 | 7.87 |
| 44857.927083333336 | 7.86 |
| 44857.9375 | 7.85 |
| 44857.947916666664 | 7.85 |
| 44857.958333333336 | 7.85 |
| 44857.96875 | 7.84 |
| 44857.979166666664 | 7.84 |
| 44857.989583333336 | 7.83 |
| 44858.0 | 7.83 |
| 44858.010416666664 | 7.84 |
| 44858.020833333336 | 7.84 |
| 44858.03125 | 7.82 |
| 44858.041666666664 | 7.82 |
| 44858.052083333336 | 7.82 |
| 44858.0625 | 7.82 |
| 44858.072916666664 | 7.81 |
| 44858.083333333336 | 7.81 |
| 44858.09375 | 7.8 |
| 44858.104166666664 | 7.8 |
| 44858.114583333336 | 7.79 |
| 44858.125 | 7.79 |
| 44858.135416666664 | 7.78 |
| 44858.145833333336 | 7.77 |
| 44858.15625 | 7.77 |
| 44858.166666666664 | 7.76 |
| 44858.177083333336 | 7.76 |
| 44858.1875 | 7.75 |
| 44858.197916666664 | 7.74 |
| 44858.208333333336 | 7.74 |
| 44858.21875 | 7.74 |
| 44858.229166666664 | 7.74 |
| 44858.239583333336 | 7.73 |
| 44858.25 | 7.73 |
| 44858.260416666664 | 7.72 |
| 44858.270833333336 | 7.71 |
| 44858.28125 | 7.72 |
| 44858.291666666664 | 7.74 |
| 44858.302083333336 | 7.74 |
| 44858.3125 | 7.74 |
| 44858.322916666664 | 7.76 |
| 44858.333333333336 | 7.76 |
| 44858.34375 | 7.77 |
| 44858.354166666664 | 7.78 |
| 44858.364583333336 | 7.79 |
| 44858.375 | 7.8 |
| 44858.385416666664 | 7.8 |
| 44858.395833333336 | 7.79 |
| 44858.40625 | 7.79 |
| 44858.416666666664 | 7.78 |
| 44858.427083333336 | 7.78 |
| 44858.4375 | 7.78 |
| 44858.447916666664 | 7.78 |
| 44858.458333333336 | 7.78 |
| 44858.46875 | 7.78 |
| 44858.479166666664 | 7.78 |
| 44858.489583333336 | 7.78 |
| 44858.5 | 7.79 |
| 44858.510416666664 | 7.79 |
| 44858.520833333336 | 7.78 |
| 44858.53125 | 7.76 |
| 44858.541666666664 | 7.76 |
| 44858.552083333336 | 7.76 |
| 44858.5625 | 7.76 |
| 44858.572916666664 | 7.77 |
| 44858.583333333336 | 7.77 |
| 44858.59375 | 7.77 |
| 44858.604166666664 | 7.77 |
| 44858.614583333336 | 7.77 |
| 44858.625 | 7.76 |
| 44858.635416666664 | 7.75 |
| 44858.645833333336 | 7.73 |
| 44858.65625 | 7.72 |
| 44858.666666666664 | 7.72 |
| 44858.677083333336 | 7.73 |
| 44858.6875 | 7.73 |
| 44858.697916666664 | 7.73 |
| 44858.708333333336 | 7.73 |
| 44858.71875 | 7.74 |
| 44858.729166666664 | 7.74 |
| 44858.739583333336 | 7.74 |
| 44858.75 | 7.75 |
| 44858.760416666664 | 7.76 |
| 44858.770833333336 | 7.76 |
| 44858.78125 | 7.75 |
| 44858.791666666664 | 7.73 |
| 44858.802083333336 | 7.72 |
| 44858.8125 | 7.74 |
| 44858.822916666664 | 7.73 |
| 44858.833333333336 | 7.73 |
| 44858.84375 | 7.74 |
| 44858.854166666664 | 7.75 |
| 44858.864583333336 | 7.76 |
| 44858.875 | 7.79 |
| 44858.885416666664 | 7.81 |
| 44858.895833333336 | 7.81 |
| 44858.90625 | 7.81 |
| 44858.916666666664 | 7.81 |
| 44858.927083333336 | 7.81 |
| 44858.9375 | 7.81 |
| 44858.947916666664 | 7.81 |
| 44858.958333333336 | 7.8 |
| 44858.96875 | 7.8 |
| 44858.979166666664 | 7.79 |
| 44858.989583333336 | 7.79 |
| 44859.0 | 7.79 |
| 44859.010416666664 | 7.77 |
| 44859.020833333336 | 7.75 |
| 44859.03125 | 7.74 |
| 44859.041666666664 | 7.71 |
| 44859.052083333336 | 7.71 |
| 44859.0625 | 7.71 |
| 44859.072916666664 | 7.71 |
| 44859.083333333336 | 7.71 |
| 44859.09375 | 7.71 |
| 44859.104166666664 | 7.72 |
| 44859.114583333336 | 7.72 |
| 44859.125 | 7.73 |
| 44859.135416666664 | 7.72 |
| 44859.145833333336 | 7.71 |
| 44859.15625 | 7.68 |
| 44859.166666666664 | 7.65 |
| 44859.177083333336 | 7.63 |
| 44859.1875 | 7.61 |
| 44859.197916666664 | 7.6 |
| 44859.208333333336 | 7.62 |
| 44859.21875 | 7.67 |
| 44859.229166666664 | 7.69 |
| 44859.239583333336 | 7.68 |
| 44859.25 | 7.68 |
| 44859.260416666664 | 7.68 |
| 44859.270833333336 | 7.67 |
| 44859.28125 | 7.64 |
| 44859.291666666664 | 7.59 |
| 44859.302083333336 | 7.62 |
| 44859.3125 | 7.63 |
| 44859.322916666664 | 7.64 |
| 44859.333333333336 | 7.65 |
| 44859.34375 | 7.66 |
| 44859.354166666664 | 7.67 |
| 44859.364583333336 | 7.67 |
| 44859.375 | 7.68 |
| 44859.385416666664 | 7.69 |
| 44859.395833333336 | 7.7 |
| 44859.40625 | 7.7 |
| 44859.416666666664 | 7.7 |
| 44859.427083333336 | 7.7 |
| 44859.4375 | 7.7 |
| 44859.447916666664 | 7.7 |
| 44859.458333333336 | 7.7 |
| 44859.46875 | 7.7 |
| 44859.479166666664 | 7.7 |
| 44859.489583333336 | 7.69 |
| 44859.5 | 7.69 |
| 44859.510416666664 | 7.68 |
| 44859.520833333336 | 7.68 |
| 44859.53125 | 7.67 |
| 44859.541666666664 | 7.65 |
| 44859.552083333336 | 7.64 |
| 44859.5625 | 7.63 |
| 44859.572916666664 | 7.58 |
| 44859.583333333336 | 7.58 |
| 44859.59375 | 7.62 |
| 44859.604166666664 | 7.63 |
| 44859.614583333336 | 7.64 |
| 44859.625 | 7.66 |
| 44859.635416666664 | 7.66 |
| 44859.645833333336 | 7.66 |
| 44859.65625 | 7.66 |
| 44859.666666666664 | 7.66 |
| 44859.677083333336 | 7.65 |
| 44859.6875 | 7.65 |
| 44859.697916666664 | 7.64 |
| 44859.708333333336 | 7.63 |
| 44859.71875 | 7.62 |
| 44859.729166666664 | 7.62 |
| 44859.739583333336 | 7.62 |
| 44859.75 | 7.65 |
| 44859.760416666664 | 7.66 |
| 44859.770833333336 | 7.67 |
| 44859.78125 | 7.66 |
| 44859.791666666664 | 7.66 |
| 44859.802083333336 | 7.65 |
| 44859.8125 | 7.62 |
| 44859.822916666664 | 7.57 |
| 44859.833333333336 | 7.61 |
| 44859.84375 | 7.62 |
| 44859.854166666664 | 7.61 |
| 44859.864583333336 | 7.61 |
| 44859.875 | 7.61 |
| 44859.885416666664 | 7.61 |
| 44859.895833333336 | 7.63 |
| 44859.90625 | 7.65 |
| 44859.916666666664 | 7.66 |
| 44859.927083333336 | 7.67 |
| 44859.9375 | 7.66 |
| 44859.947916666664 | 7.66 |
| 44859.958333333336 | 7.67 |
| 44859.96875 | 7.67 |
| 44859.979166666664 | 7.65 |
| 44859.989583333336 | 7.65 |
| 44860.0 | 7.65 |
| 44860.010416666664 | 7.66 |
| 44860.020833333336 | 7.65 |
| 44860.03125 | 7.63 |
| 44860.041666666664 | 7.61 |
| 44860.052083333336 | 7.61 |
| 44860.0625 | 7.6 |
| 44860.072916666664 | 7.57 |
| 44860.083333333336 | 7.56 |
| 44860.09375 | 7.54 |
| 44860.104166666664 | 7.55 |
| 44860.114583333336 | 7.56 |
| 44860.125 | 7.57 |
| 44860.135416666664 | 7.59 |
| 44860.145833333336 | 7.58 |
| 44860.15625 | 7.59 |
| 44860.166666666664 | 7.58 |
| 44860.177083333336 | 7.56 |
| 44860.1875 | 7.55 |
| 44860.197916666664 | 7.52 |
| 44860.208333333336 | 7.5 |
| 44860.21875 | 7.5 |
| 44860.229166666664 | 7.5 |
| 44860.239583333336 | 7.52 |
| 44860.25 | 7.55 |
| 44860.260416666664 | 7.57 |
| 44860.270833333336 | 7.56 |
| 44860.28125 | 7.55 |
| 44860.291666666664 | 7.54 |
| 44860.302083333336 | 7.52 |
| 44860.3125 | 7.47 |
| 44860.322916666664 | 7.45 |
| 44860.333333333336 | 7.51 |
| 44860.34375 | 7.52 |
| 44860.354166666664 | 7.54 |
| 44860.364583333336 | 7.54 |
| 44860.375 | 7.54 |
| 44860.385416666664 | 7.55 |
| 44860.395833333336 | 7.57 |
| 44860.40625 | 7.58 |
| 44860.416666666664 | 7.58 |
| 44860.427083333336 | 7.58 |
| 44860.4375 | 7.59 |
| 44860.447916666664 | 7.58 |
| 44860.458333333336 | 7.58 |
| 44860.46875 | 7.58 |
| 44860.479166666664 | 7.58 |
| 44860.489583333336 | 7.57 |
| 44860.5 | 7.57 |
| 44860.510416666664 | 7.57 |
| 44860.520833333336 | 7.59 |
| 44860.53125 | 7.58 |
| 44860.541666666664 | 7.58 |
| 44860.552083333336 | 7.58 |
| 44860.5625 | 7.56 |
| 44860.572916666664 | 7.55 |
| 44860.583333333336 | 7.55 |
| 44860.59375 | 7.55 |
| 44860.604166666664 | 7.53 |
| 44860.614583333336 | 7.53 |
| 44860.625 | 7.54 |
| 44860.635416666664 | 7.57 |
| 44860.645833333336 | 7.59 |
| 44860.65625 | 7.57 |
| 44860.666666666664 | 7.58 |
| 44860.677083333336 | 7.59 |
| 44860.6875 | 7.59 |
| 44860.697916666664 | 7.58 |
| 44860.708333333336 | 7.58 |
| 44860.71875 | 7.58 |
| 44860.729166666664 | 7.58 |
| 44860.739583333336 | 7.57 |
| 44860.75 | 7.57 |
| 44860.760416666664 | 7.57 |
| 44860.770833333336 | 7.57 |
| 44860.78125 | 7.57 |
| 44860.791666666664 | 7.58 |
| 44860.802083333336 | 7.57 |
| 44860.8125 | 7.6 |
| 44860.822916666664 | 7.6 |
| 44860.833333333336 | 7.58 |
| 44860.84375 | 7.58 |
| 44860.854166666664 | 7.59 |
| 44860.864583333336 | 7.52 |
| 44860.875 | 7.52 |
| 44860.885416666664 | 7.5 |
| 44860.895833333336 | 7.5 |
| 44860.90625 | 7.53 |
| 44860.916666666664 | 7.54 |
| 44860.927083333336 | 7.55 |
| 44860.9375 | 7.58 |
| 44860.947916666664 | 7.59 |
| 44860.958333333336 | 7.61 |
| 44860.96875 | 7.61 |
| 44860.979166666664 | 7.6 |
| 44860.989583333336 | 7.59 |
| 44861.0 | 7.59 |
| 44861.010416666664 | 7.58 |
| 44861.020833333336 | 7.58 |
| 44861.03125 | 7.57 |
| 44861.041666666664 | 7.57 |
| 44861.052083333336 | 7.58 |
| 44861.0625 | 7.58 |
| 44861.072916666664 | 7.57 |
| 44861.083333333336 | 7.56 |
| 44861.09375 | 7.56 |
| 44861.104166666664 | 7.55 |
| 44861.114583333336 | 7.56 |
| 44861.125 | 7.56 |
| 44861.135416666664 | 7.57 |
| 44861.145833333336 | 7.57 |
| 44861.15625 | 7.56 |
| 44861.166666666664 | 7.58 |
| 44861.177083333336 | 7.56 |
| 44861.1875 | 7.55 |
| 44861.197916666664 | 7.53 |
| 44861.208333333336 | 7.52 |
| 44861.21875 | 7.51 |
| 44861.229166666664 | 7.5 |
| 44861.239583333336 | 7.49 |
| 44861.25 | 7.49 |
| 44861.260416666664 | 7.52 |
| 44861.270833333336 | 7.53 |
| 44861.28125 | 7.54 |
| 44861.291666666664 | 7.55 |
| 44861.302083333336 | 7.56 |
| 44861.3125 | 7.55 |
| 44861.322916666664 | 7.55 |
| 44861.333333333336 | 7.53 |
| 44861.34375 | 7.48 |
| 44861.354166666664 | 7.47 |
| 44861.364583333336 | 7.5 |
| 44861.375 | 7.52 |
| 44861.385416666664 | 7.52 |
| 44861.395833333336 | 7.52 |
| 44861.40625 | 7.52 |
| 44861.416666666664 | 7.53 |
| 44861.427083333336 | 7.55 |
| 44861.4375 | 7.56 |
| 44861.447916666664 | 7.57 |
| 44861.458333333336 | 7.58 |
| 44861.46875 | 7.59 |
| 44861.479166666664 | 7.59 |
| 44861.489583333336 | 7.6 |
| 44861.5 | 7.6 |
| 44861.510416666664 | 7.6 |
| 44861.520833333336 | 7.59 |
| 44861.53125 | 7.59 |
| 44861.541666666664 | 7.59 |
| 44861.552083333336 | 7.6 |
| 44861.5625 | 7.61 |
| 44861.572916666664 | 7.62 |
| 44861.583333333336 | 7.63 |
| 44861.59375 | 7.64 |
| 44861.604166666664 | 7.64 |
| 44861.614583333336 | 7.65 |
| 44861.625 | 7.65 |
| 44861.635416666664 | 7.64 |
| 44861.645833333336 | 7.64 |
| 44861.65625 | 7.65 |
| 44861.666666666664 | 7.65 |
| 44861.677083333336 | 7.66 |
| 44861.6875 | 7.68 |
| 44861.697916666664 | 7.68 |
| 44861.708333333336 | 7.68 |
| 44861.71875 | 7.69 |
| 44861.729166666664 | 7.69 |
| 44861.739583333336 | 7.69 |
| 44861.75 | 7.69 |
| 44861.760416666664 | 7.69 |
| 44861.770833333336 | 7.68 |
| 44861.78125 | 7.7 |
| 44861.791666666664 | 7.7 |
| 44861.802083333336 | 7.7 |
| 44861.8125 | 7.71 |
| 44861.822916666664 | 7.7 |
| 44861.833333333336 | 7.7 |
| 44861.84375 | 7.7 |
| 44861.854166666664 | 7.71 |
| 44861.864583333336 | 7.71 |
| 44861.875 | 7.71 |
| 44861.885416666664 | 7.67 |
| 44861.895833333336 | 7.68 |
| 44861.90625 | 7.71 |
| 44861.916666666664 | 7.69 |
| 44861.927083333336 | 7.69 |
| 44861.9375 | 7.69 |
| 44861.947916666664 | 7.69 |
| 44861.958333333336 | 7.69 |
| 44861.96875 | 7.7 |
| 44861.979166666664 | 7.71 |
| 44861.989583333336 | 7.71 |
| 44862.0 | 7.7 |
| 44862.010416666664 | 7.7 |
| 44862.020833333336 | 7.7 |
| 44862.03125 | 7.7 |
| 44862.041666666664 | 7.7 |
| 44862.052083333336 | 7.69 |
| 44862.0625 | 7.69 |
| 44862.072916666664 | 7.69 |
| 44862.083333333336 | 7.68 |
| 44862.09375 | 7.68 |
| 44862.104166666664 | 7.68 |
| 44862.114583333336 | 7.68 |
| 44862.125 | 7.68 |
| 44862.135416666664 | 7.67 |
| 44862.145833333336 | 7.67 |
| 44862.15625 | 7.66 |
| 44862.166666666664 | 7.66 |
| 44862.177083333336 | 7.67 |
| 44862.1875 | 7.67 |
| 44862.197916666664 | 7.67 |
| 44862.208333333336 | 7.66 |
| 44862.21875 | 7.66 |
| 44862.229166666664 | 7.65 |
| 44862.239583333336 | 7.64 |
| 44862.25 | 7.63 |
| 44862.260416666664 | 7.64 |
| 44862.270833333336 | 7.63 |
| 44862.28125 | 7.63 |
| 44862.291666666664 | 7.66 |
| 44862.302083333336 | 7.68 |
| 44862.3125 | 7.67 |
| 44862.322916666664 | 7.7 |
| 44862.333333333336 | 7.7 |
| 44862.34375 | 7.7 |
| 44862.354166666664 | 7.68 |
| 44862.364583333336 | 7.66 |
| 44862.375 | 7.65 |
| 44862.385416666664 | 7.67 |
| 44862.395833333336 | 7.67 |
| 44862.40625 | 7.67 |
| 44862.416666666664 | 7.69 |
| 44862.427083333336 | 7.68 |
| 44862.4375 | 7.68 |
| 44862.447916666664 | 7.68 |
| 44862.458333333336 | 7.69 |
| 44862.46875 | 7.69 |
| 44862.479166666664 | 7.69 |
| 44862.489583333336 | 7.69 |
| 44862.5 | 7.69 |
| 44862.510416666664 | 7.69 |
| 44862.520833333336 | 7.69 |
| 44862.53125 | 7.7 |
| 44862.541666666664 | 7.7 |
| 44862.552083333336 | 7.71 |
| 44862.5625 | 7.73 |
| 44862.572916666664 | 7.75 |
| 44862.583333333336 | 7.76 |
| 44862.59375 | 7.77 |
| 44862.604166666664 | 7.77 |
| 44862.614583333336 | 7.77 |
| 44862.625 | 7.77 |
| 44862.635416666664 | 7.78 |
| 44862.645833333336 | 7.78 |
| 44862.65625 | 7.76 |
| 44862.666666666664 | 7.76 |
| 44862.677083333336 | 7.77 |
| 44862.6875 | 7.76 |
| 44862.697916666664 | 7.77 |
| 44862.708333333336 | 7.77 |
| 44862.71875 | 7.77 |
| 44862.729166666664 | 7.77 |
| 44862.739583333336 | 7.77 |
| 44862.75 | 7.77 |
| 44862.760416666664 | 7.77 |
| 44862.770833333336 | 7.77 |
| 44862.78125 | 7.77 |
| 44862.791666666664 | 7.78 |
| 44862.802083333336 | 7.78 |
| 44862.8125 | 7.77 |
| 44862.822916666664 | 7.77 |
| 44862.833333333336 | 7.76 |
| 44862.84375 | 7.77 |
| 44862.854166666664 | 7.77 |
| 44862.864583333336 | 7.77 |
| 44862.875 | 7.77 |
| 44862.885416666664 | 7.77 |
| 44862.895833333336 | 7.79 |
| 44862.90625 | 7.79 |
| 44862.916666666664 | 7.8 |
| 44862.927083333336 | 7.82 |
| 44862.9375 | 7.8 |
| 44862.947916666664 | 7.81 |
| 44862.958333333336 | 7.81 |
| 44862.96875 | 7.79 |
| 44862.979166666664 | 7.77 |
| 44862.989583333336 | 7.77 |
| 44863.0 | 7.77 |
| 44863.010416666664 | 7.78 |
| 44863.020833333336 | 7.77 |
| 44863.03125 | 7.77 |
| 44863.041666666664 | 7.77 |
| 44863.052083333336 | 7.77 |
| 44863.0625 | 7.76 |
| 44863.072916666664 | 7.75 |
| 44863.083333333336 | 7.75 |
| 44863.09375 | 7.77 |
| 44863.104166666664 | 7.75 |
| 44863.114583333336 | 7.76 |
| 44863.125 | 7.75 |
| 44863.135416666664 | 7.76 |
| 44863.145833333336 | 7.76 |
| 44863.15625 | 7.76 |
| 44863.166666666664 | 7.75 |
| 44863.177083333336 | 7.76 |
| 44863.1875 | 7.77 |
| 44863.197916666664 | 7.74 |
| 44863.208333333336 | 7.71 |
| 44863.21875 | 7.72 |
| 44863.229166666664 | 7.71 |
| 44863.239583333336 | 7.74 |
| 44863.25 | 7.73 |
| 44863.260416666664 | 7.71 |
| 44863.270833333336 | 7.69 |
| 44863.28125 | 7.67 |
| 44863.291666666664 | 7.66 |
| 44863.302083333336 | 7.64 |
| 44863.3125 | 7.62 |
| 44863.322916666664 | 7.62 |
| 44863.333333333336 | 7.63 |
| 44863.34375 | 7.64 |
| 44863.354166666664 | 7.64 |
| 44863.364583333336 | 7.64 |
| 44863.375 | 7.65 |
| 44863.385416666664 | 7.64 |
| 44863.395833333336 | 7.64 |
| 44863.40625 | 7.63 |
| 44863.416666666664 | 7.63 |
| 44863.427083333336 | 7.66 |
| 44863.4375 | 7.66 |
| 44863.447916666664 | 7.67 |
| 44863.458333333336 | 7.68 |
| 44863.46875 | 7.69 |
| 44863.479166666664 | 7.7 |
| 44863.489583333336 | 7.71 |
| 44863.5 | 7.72 |
| 44863.510416666664 | 7.74 |
| 44863.520833333336 | 7.74 |
| 44863.53125 | 7.74 |
| 44863.541666666664 | 7.74 |
| 44863.552083333336 | 7.74 |
| 44863.5625 | 7.75 |
| 44863.572916666664 | 7.75 |
| 44863.583333333336 | 7.75 |
| 44863.59375 | 7.76 |
| 44863.604166666664 | 7.76 |
| 44863.614583333336 | 7.78 |
| 44863.625 | 7.79 |
| 44863.635416666664 | 7.8 |
| 44863.645833333336 | 7.81 |
| 44863.65625 | 7.82 |
| 44863.666666666664 | 7.83 |
| 44863.677083333336 | 7.84 |
| 44863.6875 | 7.83 |
| 44863.697916666664 | 7.81 |
| 44863.708333333336 | 7.82 |
| 44863.71875 | 7.81 |
| 44863.729166666664 | 7.81 |
| 44863.739583333336 | 7.81 |
| 44863.75 | 7.81 |
| 44863.760416666664 | 7.81 |
| 44863.770833333336 | 7.81 |
| 44863.78125 | 7.82 |
| 44863.791666666664 | 7.83 |
| 44863.802083333336 | 7.83 |
| 44863.8125 | 7.84 |
| 44863.822916666664 | 7.83 |
| 44863.833333333336 | 7.83 |
| 44863.84375 | 7.82 |
| 44863.854166666664 | 7.82 |
| 44863.864583333336 | 7.82 |
| 44863.875 | 7.82 |
| 44863.885416666664 | 7.81 |
| 44863.895833333336 | 7.82 |
| 44863.90625 | 7.82 |
| 44863.916666666664 | 7.83 |
| 44863.927083333336 | 7.81 |
| 44863.9375 | 7.81 |
| 44863.947916666664 | 7.78 |
| 44863.958333333336 | 7.77 |
| 44863.96875 | 7.74 |
| 44863.979166666664 | 7.74 |
| 44863.989583333336 | 7.76 |
| 44864.0 | 7.78 |
| 44864.010416666664 | 7.79 |
| 44864.020833333336 | 7.8 |
| 44864.03125 | 7.81 |
| 44864.041666666664 | 7.82 |
| 44864.052083333336 | 7.82 |
| 44864.0625 | 7.82 |
| 44864.072916666664 | 7.82 |
| 44864.083333333336 | 7.83 |
| 44864.09375 | 7.82 |
| 44864.104166666664 | 7.82 |
| 44864.114583333336 | 7.81 |
| 44864.125 | 7.81 |
| 44864.135416666664 | 7.8 |
| 44864.145833333336 | 7.79 |
| 44864.15625 | 7.78 |
| 44864.166666666664 | 7.77 |
| 44864.177083333336 | 7.76 |
| 44864.1875 | 7.76 |
| 44864.197916666664 | 7.73 |
| 44864.208333333336 | 7.71 |
| 44864.21875 | 7.72 |
| 44864.229166666664 | 7.75 |
| 44864.239583333336 | 7.76 |
| 44864.25 | 7.76 |
| 44864.260416666664 | 7.77 |
| 44864.270833333336 | 7.77 |
| 44864.28125 | 7.76 |
| 44864.291666666664 | 7.75 |
| 44864.302083333336 | 7.74 |
| 44864.3125 | 7.74 |
| 44864.322916666664 | 7.73 |
| 44864.333333333336 | 7.72 |
| 44864.34375 | 7.7 |
| 44864.354166666664 | 7.69 |
| 44864.364583333336 | 7.69 |
| 44864.375 | 7.7 |
| 44864.385416666664 | 7.72 |
| 44864.395833333336 | 7.71 |
| 44864.40625 | 7.72 |
| 44864.416666666664 | 7.71 |
| 44864.427083333336 | 7.71 |
| 44864.4375 | 7.7 |
| 44864.447916666664 | 7.7 |
| 44864.458333333336 | 7.7 |
| 44864.46875 | 7.7 |
| 44864.479166666664 | 7.71 |
| 44864.489583333336 | 7.72 |
| 44864.5 | 7.73 |
| 44864.510416666664 | 7.74 |
| 44864.520833333336 | 7.75 |
| 44864.53125 | 7.75 |
| 44864.541666666664 | 7.76 |
| 44864.552083333336 | 7.77 |
| 44864.5625 | 7.78 |
| 44864.572916666664 | 7.78 |
| 44864.583333333336 | 7.78 |
| 44864.59375 | 7.78 |
| 44864.604166666664 | 7.78 |
| 44864.614583333336 | 7.78 |
| 44864.625 | 7.78 |
| 44864.635416666664 | 7.79 |
| 44864.645833333336 | 7.8 |
| 44864.65625 | 7.82 |
| 44864.666666666664 | 7.83 |
| 44864.677083333336 | 7.84 |
| 44864.6875 | 7.84 |
| 44864.697916666664 | 7.85 |
| 44864.708333333336 | 7.86 |
| 44864.71875 | 7.87 |
| 44864.729166666664 | 7.84 |
| 44864.739583333336 | 7.84 |
| 44864.75 | 7.82 |
| 44864.760416666664 | 7.84 |
| 44864.770833333336 | 7.84 |
| 44864.78125 | 7.84 |
| 44864.791666666664 | 7.85 |
| 44864.802083333336 | 7.84 |
| 44864.8125 | 7.85 |
| 44864.822916666664 | 7.85 |
| 44864.833333333336 | 7.85 |
| 44864.84375 | 7.84 |
| 44864.854166666664 | 7.83 |
| 44864.864583333336 | 7.82 |
| 44864.875 | 7.82 |
| 44864.885416666664 | 7.81 |
| 44864.895833333336 | 7.8 |
| 44864.90625 | 7.79 |
| 44864.916666666664 | 7.8 |
| 44864.927083333336 | 7.8 |
| 44864.9375 | 7.81 |
| 44864.947916666664 | 7.8 |
| 44864.958333333336 | 7.81 |
| 44864.96875 | 7.83 |
| 44864.979166666664 | 7.82 |
| 44864.989583333336 | 7.81 |
| 44865.0 | 7.79 |
| 44865.010416666664 | 7.76 |
| 44865.020833333336 | 7.79 |
| 44865.03125 | 7.81 |
| 44865.041666666664 | 7.82 |
| 44865.052083333336 | 7.82 |
| 44865.0625 | 7.83 |
| 44865.072916666664 | 7.83 |
| 44865.083333333336 | 7.83 |
| 44865.09375 | 7.82 |
| 44865.104166666664 | 7.83 |
| 44865.114583333336 | 7.84 |
| 44865.125 | 7.82 |
| 44865.135416666664 | 7.81 |
| 44865.145833333336 | 7.8 |
| 44865.15625 | 7.81 |
| 44865.166666666664 | 7.81 |
| 44865.177083333336 | 7.8 |
| 44865.1875 | 7.79 |
| 44865.197916666664 | 7.79 |
| 44865.208333333336 | 7.77 |
| 44865.21875 | 7.75 |
| 44865.229166666664 | 7.72 |
| 44865.239583333336 | 7.69 |
| 44865.25 | 7.68 |
| 44865.260416666664 | 7.71 |
| 44865.270833333336 | 7.72 |
| 44865.28125 | 7.73 |
| 44865.291666666664 | 7.75 |
| 44865.302083333336 | 7.76 |
| 44865.3125 | 7.76 |
| 44865.322916666664 | 7.75 |
| 44865.333333333336 | 7.77 |
| 44865.34375 | 7.76 |
| 44865.354166666664 | 7.75 |
| 44865.364583333336 | 7.75 |
| 44865.375 | 7.73 |
| 44865.385416666664 | 7.72 |
| 44865.395833333336 | 7.73 |
| 44865.40625 | 7.74 |
| 44865.416666666664 | 7.74 |
| 44865.427083333336 | 7.73 |
| 44865.4375 | 7.73 |
| 44865.447916666664 | 7.74 |
| 44865.458333333336 | 7.73 |
| 44865.46875 | 7.72 |
| 44865.479166666664 | 7.7 |
| 44865.489583333336 | 7.67 |
| 44865.5 | 7.65 |
| 44865.510416666664 | 7.67 |
| 44865.520833333336 | 7.7 |
| 44865.53125 | 7.71 |
| 44865.541666666664 | 7.72 |
| 44865.552083333336 | 7.73 |
| 44865.5625 | 7.74 |
| 44865.572916666664 | 7.75 |
| 44865.583333333336 | 7.76 |
| 44865.59375 | 7.77 |
| 44865.604166666664 | 7.77 |
| 44865.614583333336 | 7.78 |
| 44865.625 | 7.78 |
| 44865.635416666664 | 7.79 |
| 44865.645833333336 | 7.78 |
| 44865.65625 | 7.79 |
| 44865.666666666664 | 7.78 |
| 44865.677083333336 | 7.79 |
| 44865.6875 | 7.81 |
| 44865.697916666664 | 7.82 |
| 44865.708333333336 | 7.84 |
| 44865.71875 | 7.85 |
| 44865.729166666664 | 7.85 |
| 44865.739583333336 | 7.85 |
| 44865.75 | 7.84 |
| 44865.760416666664 | 7.83 |
| 44865.770833333336 | 7.82 |
| 44865.78125 | 7.8 |
| 44865.791666666664 | 7.79 |
| 44865.802083333336 | 7.86 |
| 44865.8125 | 7.86 |
| 44865.822916666664 | 7.85 |
| 44865.833333333336 | 7.84 |
| 44865.84375 | 7.82 |
| 44865.854166666664 | 7.83 |
| 44865.864583333336 | 7.82 |
| 44865.875 | 7.82 |
| 44865.885416666664 | 7.8 |
| 44865.895833333336 | 7.79 |
| 44865.90625 | 7.79 |
| 44865.916666666664 | 7.77 |
| 44865.927083333336 | 7.75 |
| 44865.9375 | 7.74 |
| 44865.947916666664 | 7.76 |
| 44865.958333333336 | 7.76 |
| 44865.96875 | 7.76 |
| 44865.979166666664 | 7.76 |
| 44865.989583333336 | 7.77 |
| 44866.0 | 7.79 |
| 44866.010416666664 | 7.79 |
| 44866.020833333336 | 7.78 |
| 44866.03125 | 7.75 |
| 44866.041666666664 | 7.74 |
| 44866.052083333336 | 7.71 |
| 44866.0625 | 7.73 |
| 44866.072916666664 | 7.72 |
| 44866.083333333336 | 7.75 |
| 44866.09375 | 7.76 |
| 44866.104166666664 | 7.76 |
| 44866.114583333336 | 7.76 |
| 44866.125 | 7.76 |
| 44866.135416666664 | 7.76 |
| 44866.145833333336 | 7.76 |